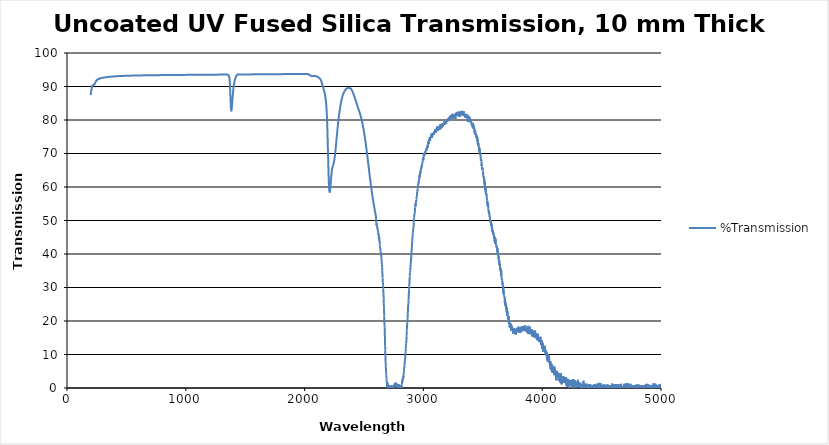
| Category | %Transmission |
|---|---|
| 200.0 | 87.428 |
| 201.0 | 87.778 |
| 202.0 | 88.083 |
| 203.0 | 88.344 |
| 204.0 | 88.635 |
| 205.0 | 88.902 |
| 206.0 | 89.097 |
| 207.0 | 89.337 |
| 208.0 | 89.529 |
| 209.0 | 89.623 |
| 210.0 | 89.787 |
| 211.0 | 89.901 |
| 212.0 | 90.016 |
| 213.0 | 90.113 |
| 214.0 | 90.202 |
| 215.0 | 90.23 |
| 216.0 | 90.302 |
| 217.0 | 90.351 |
| 218.0 | 90.356 |
| 219.0 | 90.401 |
| 220.0 | 90.414 |
| 221.0 | 90.381 |
| 222.0 | 90.471 |
| 223.0 | 90.485 |
| 224.0 | 90.482 |
| 225.0 | 90.541 |
| 226.0 | 90.559 |
| 227.0 | 90.525 |
| 228.0 | 90.577 |
| 229.0 | 90.617 |
| 230.0 | 90.607 |
| 231.0 | 90.71 |
| 232.0 | 90.729 |
| 233.0 | 90.756 |
| 234.0 | 90.831 |
| 235.0 | 90.918 |
| 236.0 | 90.964 |
| 237.0 | 91.063 |
| 238.0 | 91.155 |
| 239.0 | 91.175 |
| 240.0 | 91.287 |
| 241.0 | 91.365 |
| 242.0 | 91.411 |
| 243.0 | 91.494 |
| 244.0 | 91.572 |
| 245.0 | 91.59 |
| 246.0 | 91.684 |
| 247.0 | 91.779 |
| 248.0 | 91.776 |
| 249.0 | 91.831 |
| 250.0 | 91.902 |
| 251.0 | 91.879 |
| 252.0 | 91.984 |
| 253.0 | 91.984 |
| 254.0 | 91.994 |
| 255.0 | 92.016 |
| 256.0 | 92.077 |
| 257.0 | 92.055 |
| 258.0 | 92.086 |
| 259.0 | 92.129 |
| 260.0 | 92.091 |
| 261.0 | 92.158 |
| 262.0 | 92.177 |
| 263.0 | 92.16 |
| 264.0 | 92.205 |
| 265.0 | 92.22 |
| 266.0 | 92.2 |
| 267.0 | 92.258 |
| 268.0 | 92.284 |
| 269.0 | 92.251 |
| 270.0 | 92.319 |
| 271.0 | 92.323 |
| 272.0 | 92.293 |
| 273.0 | 92.358 |
| 274.0 | 92.373 |
| 275.0 | 92.328 |
| 276.0 | 92.392 |
| 277.0 | 92.422 |
| 278.0 | 92.397 |
| 279.0 | 92.448 |
| 280.0 | 92.456 |
| 281.0 | 92.465 |
| 282.0 | 92.473 |
| 283.0 | 92.481 |
| 284.0 | 92.489 |
| 285.0 | 92.497 |
| 286.0 | 92.505 |
| 287.0 | 92.513 |
| 288.0 | 92.521 |
| 289.0 | 92.528 |
| 290.0 | 92.536 |
| 291.0 | 92.543 |
| 292.0 | 92.55 |
| 293.0 | 92.558 |
| 294.0 | 92.565 |
| 295.0 | 92.572 |
| 296.0 | 92.579 |
| 297.0 | 92.586 |
| 298.0 | 92.593 |
| 299.0 | 92.599 |
| 300.0 | 92.606 |
| 301.0 | 92.612 |
| 302.0 | 92.619 |
| 303.0 | 92.625 |
| 304.0 | 92.632 |
| 305.0 | 92.638 |
| 306.0 | 92.644 |
| 307.0 | 92.65 |
| 308.0 | 92.656 |
| 309.0 | 92.662 |
| 310.0 | 92.668 |
| 311.0 | 92.674 |
| 312.0 | 92.68 |
| 313.0 | 92.686 |
| 314.0 | 92.691 |
| 315.0 | 92.697 |
| 316.0 | 92.702 |
| 317.0 | 92.708 |
| 318.0 | 92.713 |
| 319.0 | 92.719 |
| 320.0 | 92.724 |
| 321.0 | 92.729 |
| 322.0 | 92.735 |
| 323.0 | 92.74 |
| 324.0 | 92.745 |
| 325.0 | 92.75 |
| 326.0 | 92.755 |
| 327.0 | 92.76 |
| 328.0 | 92.765 |
| 329.0 | 92.769 |
| 330.0 | 92.774 |
| 331.0 | 92.779 |
| 332.0 | 92.784 |
| 333.0 | 92.788 |
| 334.0 | 92.793 |
| 335.0 | 92.797 |
| 336.0 | 92.802 |
| 337.0 | 92.806 |
| 338.0 | 92.811 |
| 339.0 | 92.815 |
| 340.0 | 92.819 |
| 341.0 | 92.824 |
| 342.0 | 92.828 |
| 343.0 | 92.832 |
| 344.0 | 92.836 |
| 345.0 | 92.84 |
| 346.0 | 92.844 |
| 347.0 | 92.849 |
| 348.0 | 92.853 |
| 349.0 | 92.856 |
| 350.0 | 92.86 |
| 351.0 | 92.864 |
| 352.0 | 92.868 |
| 353.0 | 92.872 |
| 354.0 | 92.876 |
| 355.0 | 92.879 |
| 356.0 | 92.883 |
| 357.0 | 92.887 |
| 358.0 | 92.89 |
| 359.0 | 92.894 |
| 360.0 | 92.898 |
| 361.0 | 92.901 |
| 362.0 | 92.905 |
| 363.0 | 92.908 |
| 364.0 | 92.912 |
| 365.0 | 92.915 |
| 366.0 | 92.918 |
| 367.0 | 92.922 |
| 368.0 | 92.925 |
| 369.0 | 92.928 |
| 370.0 | 92.932 |
| 371.0 | 92.935 |
| 372.0 | 92.938 |
| 373.0 | 92.941 |
| 374.0 | 92.944 |
| 375.0 | 92.948 |
| 376.0 | 92.951 |
| 377.0 | 92.954 |
| 378.0 | 92.957 |
| 379.0 | 92.96 |
| 380.0 | 92.963 |
| 381.0 | 92.966 |
| 382.0 | 92.969 |
| 383.0 | 92.972 |
| 384.0 | 92.975 |
| 385.0 | 92.977 |
| 386.0 | 92.98 |
| 387.0 | 92.983 |
| 388.0 | 92.986 |
| 389.0 | 92.989 |
| 390.0 | 92.991 |
| 391.0 | 92.994 |
| 392.0 | 92.997 |
| 393.0 | 93 |
| 394.0 | 93.002 |
| 395.0 | 93.005 |
| 396.0 | 93.007 |
| 397.0 | 93.01 |
| 398.0 | 93.013 |
| 399.0 | 93.015 |
| 400.0 | 93.018 |
| 401.0 | 93.02 |
| 402.0 | 93.023 |
| 403.0 | 93.025 |
| 404.0 | 93.028 |
| 405.0 | 93.03 |
| 406.0 | 93.033 |
| 407.0 | 93.035 |
| 408.0 | 93.037 |
| 409.0 | 93.04 |
| 410.0 | 93.042 |
| 411.0 | 93.044 |
| 412.0 | 93.047 |
| 413.0 | 93.049 |
| 414.0 | 93.051 |
| 415.0 | 93.053 |
| 416.0 | 93.056 |
| 417.0 | 93.058 |
| 418.0 | 93.06 |
| 419.0 | 93.062 |
| 420.0 | 93.065 |
| 421.0 | 93.067 |
| 422.0 | 93.069 |
| 423.0 | 93.071 |
| 424.0 | 93.073 |
| 425.0 | 93.075 |
| 426.0 | 93.077 |
| 427.0 | 93.079 |
| 428.0 | 93.081 |
| 429.0 | 93.083 |
| 430.0 | 93.085 |
| 431.0 | 93.087 |
| 432.0 | 93.089 |
| 433.0 | 93.091 |
| 434.0 | 93.093 |
| 435.0 | 93.095 |
| 436.0 | 93.097 |
| 437.0 | 93.099 |
| 438.0 | 93.101 |
| 439.0 | 93.103 |
| 440.0 | 93.105 |
| 441.0 | 93.107 |
| 442.0 | 93.109 |
| 443.0 | 93.11 |
| 444.0 | 93.112 |
| 445.0 | 93.114 |
| 446.0 | 93.116 |
| 447.0 | 93.118 |
| 448.0 | 93.119 |
| 449.0 | 93.121 |
| 450.0 | 93.123 |
| 451.0 | 93.125 |
| 452.0 | 93.126 |
| 453.0 | 93.128 |
| 454.0 | 93.13 |
| 455.0 | 93.132 |
| 456.0 | 93.133 |
| 457.0 | 93.135 |
| 458.0 | 93.137 |
| 459.0 | 93.138 |
| 460.0 | 93.14 |
| 461.0 | 93.142 |
| 462.0 | 93.143 |
| 463.0 | 93.145 |
| 464.0 | 93.146 |
| 465.0 | 93.148 |
| 466.0 | 93.15 |
| 467.0 | 93.151 |
| 468.0 | 93.153 |
| 469.0 | 93.154 |
| 470.0 | 93.156 |
| 471.0 | 93.157 |
| 472.0 | 93.159 |
| 473.0 | 93.16 |
| 474.0 | 93.162 |
| 475.0 | 93.163 |
| 476.0 | 93.165 |
| 477.0 | 93.166 |
| 478.0 | 93.168 |
| 479.0 | 93.169 |
| 480.0 | 93.171 |
| 481.0 | 93.172 |
| 482.0 | 93.173 |
| 483.0 | 93.175 |
| 484.0 | 93.176 |
| 485.0 | 93.178 |
| 486.0 | 93.179 |
| 487.0 | 93.18 |
| 488.0 | 93.182 |
| 489.0 | 93.183 |
| 490.0 | 93.185 |
| 491.0 | 93.186 |
| 492.0 | 93.187 |
| 493.0 | 93.189 |
| 494.0 | 93.19 |
| 495.0 | 93.191 |
| 496.0 | 93.193 |
| 497.0 | 93.194 |
| 498.0 | 93.195 |
| 499.0 | 93.196 |
| 500.0 | 93.198 |
| 501.0 | 93.199 |
| 502.0 | 93.2 |
| 503.0 | 93.201 |
| 504.0 | 93.203 |
| 505.0 | 93.204 |
| 506.0 | 93.205 |
| 507.0 | 93.206 |
| 508.0 | 93.208 |
| 509.0 | 93.209 |
| 510.0 | 93.21 |
| 511.0 | 93.211 |
| 512.0 | 93.212 |
| 513.0 | 93.214 |
| 514.0 | 93.215 |
| 515.0 | 93.216 |
| 516.0 | 93.217 |
| 517.0 | 93.218 |
| 518.0 | 93.219 |
| 519.0 | 93.221 |
| 520.0 | 93.222 |
| 521.0 | 93.223 |
| 522.0 | 93.224 |
| 523.0 | 93.225 |
| 524.0 | 93.226 |
| 525.0 | 93.227 |
| 526.0 | 93.228 |
| 527.0 | 93.23 |
| 528.0 | 93.231 |
| 529.0 | 93.232 |
| 530.0 | 93.233 |
| 531.0 | 93.234 |
| 532.0 | 93.235 |
| 533.0 | 93.236 |
| 534.0 | 93.237 |
| 535.0 | 93.238 |
| 536.0 | 93.239 |
| 537.0 | 93.24 |
| 538.0 | 93.241 |
| 539.0 | 93.242 |
| 540.0 | 93.243 |
| 541.0 | 93.244 |
| 542.0 | 93.245 |
| 543.0 | 93.246 |
| 544.0 | 93.247 |
| 545.0 | 93.248 |
| 546.0 | 93.249 |
| 547.0 | 93.25 |
| 548.0 | 93.251 |
| 549.0 | 93.252 |
| 550.0 | 93.253 |
| 551.0 | 93.254 |
| 552.0 | 93.255 |
| 553.0 | 93.256 |
| 554.0 | 93.257 |
| 555.0 | 93.258 |
| 556.0 | 93.259 |
| 557.0 | 93.26 |
| 558.0 | 93.261 |
| 559.0 | 93.262 |
| 560.0 | 93.263 |
| 561.0 | 93.264 |
| 562.0 | 93.265 |
| 563.0 | 93.265 |
| 564.0 | 93.266 |
| 565.0 | 93.267 |
| 566.0 | 93.268 |
| 567.0 | 93.269 |
| 568.0 | 93.27 |
| 569.0 | 93.271 |
| 570.0 | 93.272 |
| 571.0 | 93.273 |
| 572.0 | 93.273 |
| 573.0 | 93.274 |
| 574.0 | 93.275 |
| 575.0 | 93.276 |
| 576.0 | 93.277 |
| 577.0 | 93.278 |
| 578.0 | 93.279 |
| 579.0 | 93.279 |
| 580.0 | 93.28 |
| 581.0 | 93.281 |
| 582.0 | 93.282 |
| 583.0 | 93.283 |
| 584.0 | 93.284 |
| 585.0 | 93.284 |
| 586.0 | 93.285 |
| 587.0 | 93.286 |
| 588.0 | 93.287 |
| 589.0 | 93.288 |
| 590.0 | 93.289 |
| 591.0 | 93.289 |
| 592.0 | 93.29 |
| 593.0 | 93.291 |
| 594.0 | 93.292 |
| 595.0 | 93.292 |
| 596.0 | 93.293 |
| 597.0 | 93.294 |
| 598.0 | 93.295 |
| 599.0 | 93.296 |
| 600.0 | 93.296 |
| 601.0 | 93.297 |
| 602.0 | 93.298 |
| 603.0 | 93.299 |
| 604.0 | 93.299 |
| 605.0 | 93.3 |
| 606.0 | 93.301 |
| 607.0 | 93.302 |
| 608.0 | 93.302 |
| 609.0 | 93.303 |
| 610.0 | 93.304 |
| 611.0 | 93.305 |
| 612.0 | 93.305 |
| 613.0 | 93.306 |
| 614.0 | 93.307 |
| 615.0 | 93.307 |
| 616.0 | 93.308 |
| 617.0 | 93.309 |
| 618.0 | 93.31 |
| 619.0 | 93.31 |
| 620.0 | 93.311 |
| 621.0 | 93.312 |
| 622.0 | 93.312 |
| 623.0 | 93.313 |
| 624.0 | 93.314 |
| 625.0 | 93.314 |
| 626.0 | 93.315 |
| 627.0 | 93.316 |
| 628.0 | 93.317 |
| 629.0 | 93.317 |
| 630.0 | 93.318 |
| 631.0 | 93.319 |
| 632.0 | 93.319 |
| 633.0 | 93.32 |
| 634.0 | 93.321 |
| 635.0 | 93.321 |
| 636.0 | 93.322 |
| 637.0 | 93.323 |
| 638.0 | 93.323 |
| 639.0 | 93.324 |
| 640.0 | 93.324 |
| 641.0 | 93.325 |
| 642.0 | 93.326 |
| 643.0 | 93.326 |
| 644.0 | 93.327 |
| 645.0 | 93.328 |
| 646.0 | 93.328 |
| 647.0 | 93.329 |
| 648.0 | 93.33 |
| 649.0 | 93.33 |
| 650.0 | 93.331 |
| 651.0 | 93.331 |
| 652.0 | 93.332 |
| 653.0 | 93.333 |
| 654.0 | 93.333 |
| 655.0 | 93.334 |
| 656.0 | 93.335 |
| 657.0 | 93.335 |
| 658.0 | 93.336 |
| 659.0 | 93.336 |
| 660.0 | 93.337 |
| 661.0 | 93.338 |
| 662.0 | 93.338 |
| 663.0 | 93.339 |
| 664.0 | 93.339 |
| 665.0 | 93.34 |
| 666.0 | 93.34 |
| 667.0 | 93.341 |
| 668.0 | 93.342 |
| 669.0 | 93.342 |
| 670.0 | 93.343 |
| 671.0 | 93.343 |
| 672.0 | 93.344 |
| 673.0 | 93.345 |
| 674.0 | 93.345 |
| 675.0 | 93.346 |
| 676.0 | 93.346 |
| 677.0 | 93.347 |
| 678.0 | 93.347 |
| 679.0 | 93.348 |
| 680.0 | 93.349 |
| 681.0 | 93.349 |
| 682.0 | 93.35 |
| 683.0 | 93.35 |
| 684.0 | 93.351 |
| 685.0 | 93.351 |
| 686.0 | 93.352 |
| 687.0 | 93.352 |
| 688.0 | 93.353 |
| 689.0 | 93.353 |
| 690.0 | 93.354 |
| 691.0 | 93.355 |
| 692.0 | 93.355 |
| 693.0 | 93.356 |
| 694.0 | 93.356 |
| 695.0 | 93.357 |
| 696.0 | 93.357 |
| 697.0 | 93.358 |
| 698.0 | 93.358 |
| 699.0 | 93.359 |
| 700.0 | 93.359 |
| 701.0 | 93.36 |
| 702.0 | 93.36 |
| 703.0 | 93.361 |
| 704.0 | 93.361 |
| 705.0 | 93.362 |
| 706.0 | 93.362 |
| 707.0 | 93.363 |
| 708.0 | 93.363 |
| 709.0 | 93.364 |
| 710.0 | 93.364 |
| 711.0 | 93.365 |
| 712.0 | 93.365 |
| 713.0 | 93.366 |
| 714.0 | 93.366 |
| 715.0 | 93.367 |
| 716.0 | 93.367 |
| 717.0 | 93.368 |
| 718.0 | 93.368 |
| 719.0 | 93.369 |
| 720.0 | 93.369 |
| 721.0 | 93.37 |
| 722.0 | 93.37 |
| 723.0 | 93.371 |
| 724.0 | 93.371 |
| 725.0 | 93.372 |
| 726.0 | 93.372 |
| 727.0 | 93.373 |
| 728.0 | 93.373 |
| 729.0 | 93.374 |
| 730.0 | 93.374 |
| 731.0 | 93.375 |
| 732.0 | 93.375 |
| 733.0 | 93.376 |
| 734.0 | 93.376 |
| 735.0 | 93.377 |
| 736.0 | 93.377 |
| 737.0 | 93.378 |
| 738.0 | 93.378 |
| 739.0 | 93.378 |
| 740.0 | 93.379 |
| 741.0 | 93.379 |
| 742.0 | 93.38 |
| 743.0 | 93.38 |
| 744.0 | 93.381 |
| 745.0 | 93.381 |
| 746.0 | 93.382 |
| 747.0 | 93.382 |
| 748.0 | 93.383 |
| 749.0 | 93.383 |
| 750.0 | 93.384 |
| 751.0 | 93.384 |
| 752.0 | 93.384 |
| 753.0 | 93.385 |
| 754.0 | 93.385 |
| 755.0 | 93.386 |
| 756.0 | 93.386 |
| 757.0 | 93.387 |
| 758.0 | 93.387 |
| 759.0 | 93.388 |
| 760.0 | 93.388 |
| 761.0 | 93.388 |
| 762.0 | 93.389 |
| 763.0 | 93.389 |
| 764.0 | 93.39 |
| 765.0 | 93.39 |
| 766.0 | 93.391 |
| 767.0 | 93.391 |
| 768.0 | 93.391 |
| 769.0 | 93.392 |
| 770.0 | 93.392 |
| 771.0 | 93.393 |
| 772.0 | 93.393 |
| 773.0 | 93.394 |
| 774.0 | 93.394 |
| 775.0 | 93.394 |
| 776.0 | 93.395 |
| 777.0 | 93.395 |
| 778.0 | 93.396 |
| 779.0 | 93.396 |
| 780.0 | 93.396 |
| 781.0 | 93.397 |
| 782.0 | 93.397 |
| 783.0 | 93.398 |
| 784.0 | 93.398 |
| 785.0 | 93.399 |
| 786.0 | 93.399 |
| 787.0 | 93.399 |
| 788.0 | 93.4 |
| 789.0 | 93.4 |
| 790.0 | 93.401 |
| 791.0 | 93.401 |
| 792.0 | 93.401 |
| 793.0 | 93.402 |
| 794.0 | 93.402 |
| 795.0 | 93.403 |
| 796.0 | 93.403 |
| 797.0 | 93.403 |
| 798.0 | 93.404 |
| 799.0 | 93.404 |
| 800.0 | 93.405 |
| 801.0 | 93.405 |
| 802.0 | 93.405 |
| 803.0 | 93.406 |
| 804.0 | 93.406 |
| 805.0 | 93.407 |
| 806.0 | 93.407 |
| 807.0 | 93.407 |
| 808.0 | 93.408 |
| 809.0 | 93.408 |
| 810.0 | 93.408 |
| 811.0 | 93.409 |
| 812.0 | 93.409 |
| 813.0 | 93.41 |
| 814.0 | 93.41 |
| 815.0 | 93.41 |
| 816.0 | 93.411 |
| 817.0 | 93.411 |
| 818.0 | 93.412 |
| 819.0 | 93.412 |
| 820.0 | 93.412 |
| 821.0 | 93.413 |
| 822.0 | 93.413 |
| 823.0 | 93.413 |
| 824.0 | 93.414 |
| 825.0 | 93.414 |
| 826.0 | 93.415 |
| 827.0 | 93.415 |
| 828.0 | 93.415 |
| 829.0 | 93.416 |
| 830.0 | 93.416 |
| 831.0 | 93.416 |
| 832.0 | 93.417 |
| 833.0 | 93.417 |
| 834.0 | 93.418 |
| 835.0 | 93.418 |
| 836.0 | 93.418 |
| 837.0 | 93.419 |
| 838.0 | 93.419 |
| 839.0 | 93.419 |
| 840.0 | 93.42 |
| 841.0 | 93.42 |
| 842.0 | 93.42 |
| 843.0 | 93.421 |
| 844.0 | 93.421 |
| 845.0 | 93.422 |
| 846.0 | 93.422 |
| 847.0 | 93.422 |
| 848.0 | 93.423 |
| 849.0 | 93.423 |
| 850.0 | 93.423 |
| 851.0 | 93.424 |
| 852.0 | 93.424 |
| 853.0 | 93.424 |
| 854.0 | 93.425 |
| 855.0 | 93.425 |
| 856.0 | 93.425 |
| 857.0 | 93.426 |
| 858.0 | 93.426 |
| 859.0 | 93.426 |
| 860.0 | 93.427 |
| 861.0 | 93.427 |
| 862.0 | 93.428 |
| 863.0 | 93.428 |
| 864.0 | 93.428 |
| 865.0 | 93.429 |
| 866.0 | 93.429 |
| 867.0 | 93.429 |
| 868.0 | 93.43 |
| 869.0 | 93.43 |
| 870.0 | 93.43 |
| 871.0 | 93.431 |
| 872.0 | 93.431 |
| 873.0 | 93.431 |
| 874.0 | 93.432 |
| 875.0 | 93.432 |
| 876.0 | 93.432 |
| 877.0 | 93.433 |
| 878.0 | 93.433 |
| 879.0 | 93.433 |
| 880.0 | 93.434 |
| 881.0 | 93.434 |
| 882.0 | 93.434 |
| 883.0 | 93.435 |
| 884.0 | 93.435 |
| 885.0 | 93.435 |
| 886.0 | 93.436 |
| 887.0 | 93.436 |
| 888.0 | 93.436 |
| 889.0 | 93.437 |
| 890.0 | 93.437 |
| 891.0 | 93.437 |
| 892.0 | 93.438 |
| 893.0 | 93.438 |
| 894.0 | 93.438 |
| 895.0 | 93.439 |
| 896.0 | 93.439 |
| 897.0 | 93.439 |
| 898.0 | 93.44 |
| 899.0 | 93.44 |
| 900.0 | 93.44 |
| 901.0 | 93.441 |
| 902.0 | 93.441 |
| 903.0 | 93.441 |
| 904.0 | 93.442 |
| 905.0 | 93.442 |
| 906.0 | 93.442 |
| 907.0 | 93.443 |
| 908.0 | 93.443 |
| 909.0 | 93.443 |
| 910.0 | 93.444 |
| 911.0 | 93.444 |
| 912.0 | 93.444 |
| 913.0 | 93.444 |
| 914.0 | 93.445 |
| 915.0 | 93.445 |
| 916.0 | 93.445 |
| 917.0 | 93.446 |
| 918.0 | 93.446 |
| 919.0 | 93.446 |
| 920.0 | 93.447 |
| 921.0 | 93.447 |
| 922.0 | 93.447 |
| 923.0 | 93.448 |
| 924.0 | 93.448 |
| 925.0 | 93.448 |
| 926.0 | 93.449 |
| 927.0 | 93.449 |
| 928.0 | 93.449 |
| 929.0 | 93.45 |
| 930.0 | 93.45 |
| 931.0 | 93.45 |
| 932.0 | 93.45 |
| 933.0 | 93.451 |
| 934.0 | 93.451 |
| 935.0 | 93.451 |
| 936.0 | 93.452 |
| 937.0 | 93.452 |
| 938.0 | 93.452 |
| 939.0 | 93.453 |
| 940.0 | 93.453 |
| 941.0 | 93.453 |
| 942.0 | 93.454 |
| 943.0 | 93.454 |
| 944.0 | 93.454 |
| 945.0 | 93.455 |
| 946.0 | 93.455 |
| 947.0 | 93.455 |
| 948.0 | 93.455 |
| 949.0 | 93.456 |
| 950.0 | 93.456 |
| 951.0 | 93.456 |
| 952.0 | 93.457 |
| 953.0 | 93.457 |
| 954.0 | 93.457 |
| 955.0 | 93.458 |
| 956.0 | 93.458 |
| 957.0 | 93.458 |
| 958.0 | 93.458 |
| 959.0 | 93.459 |
| 960.0 | 93.459 |
| 961.0 | 93.459 |
| 962.0 | 93.46 |
| 963.0 | 93.46 |
| 964.0 | 93.46 |
| 965.0 | 93.461 |
| 966.0 | 93.461 |
| 967.0 | 93.461 |
| 968.0 | 93.461 |
| 969.0 | 93.462 |
| 970.0 | 93.462 |
| 971.0 | 93.462 |
| 972.0 | 93.463 |
| 973.0 | 93.463 |
| 974.0 | 93.463 |
| 975.0 | 93.464 |
| 976.0 | 93.464 |
| 977.0 | 93.464 |
| 978.0 | 93.464 |
| 979.0 | 93.465 |
| 980.0 | 93.465 |
| 981.0 | 93.465 |
| 982.0 | 93.466 |
| 983.0 | 93.466 |
| 984.0 | 93.466 |
| 985.0 | 93.466 |
| 986.0 | 93.467 |
| 987.0 | 93.467 |
| 988.0 | 93.467 |
| 989.0 | 93.468 |
| 990.0 | 93.468 |
| 991.0 | 93.468 |
| 992.0 | 93.469 |
| 993.0 | 93.469 |
| 994.0 | 93.469 |
| 995.0 | 93.469 |
| 996.0 | 93.47 |
| 997.0 | 93.47 |
| 998.0 | 93.47 |
| 999.0 | 93.471 |
| 1000.0 | 93.471 |
| 1001.0 | 93.471 |
| 1002.0 | 93.471 |
| 1003.0 | 93.472 |
| 1004.0 | 93.472 |
| 1005.0 | 93.472 |
| 1006.0 | 93.473 |
| 1007.0 | 93.473 |
| 1008.0 | 93.473 |
| 1009.0 | 93.473 |
| 1010.0 | 93.474 |
| 1011.0 | 93.474 |
| 1012.0 | 93.474 |
| 1013.0 | 93.475 |
| 1014.0 | 93.475 |
| 1015.0 | 93.475 |
| 1016.0 | 93.475 |
| 1017.0 | 93.476 |
| 1018.0 | 93.476 |
| 1019.0 | 93.476 |
| 1020.0 | 93.477 |
| 1021.0 | 93.477 |
| 1022.0 | 93.477 |
| 1023.0 | 93.477 |
| 1024.0 | 93.478 |
| 1025.0 | 93.478 |
| 1026.0 | 93.478 |
| 1027.0 | 93.479 |
| 1028.0 | 93.479 |
| 1029.0 | 93.479 |
| 1030.0 | 93.479 |
| 1031.0 | 93.48 |
| 1032.0 | 93.48 |
| 1033.0 | 93.48 |
| 1034.0 | 93.48 |
| 1035.0 | 93.481 |
| 1036.0 | 93.481 |
| 1037.0 | 93.481 |
| 1038.0 | 93.482 |
| 1039.0 | 93.482 |
| 1040.0 | 93.482 |
| 1041.0 | 93.482 |
| 1042.0 | 93.483 |
| 1043.0 | 93.483 |
| 1044.0 | 93.483 |
| 1045.0 | 93.484 |
| 1046.0 | 93.484 |
| 1047.0 | 93.484 |
| 1048.0 | 93.484 |
| 1049.0 | 93.485 |
| 1050.0 | 93.485 |
| 1051.0 | 93.485 |
| 1052.0 | 93.486 |
| 1053.0 | 93.486 |
| 1054.0 | 93.486 |
| 1055.0 | 93.486 |
| 1056.0 | 93.487 |
| 1057.0 | 93.487 |
| 1058.0 | 93.487 |
| 1059.0 | 93.487 |
| 1060.0 | 93.488 |
| 1061.0 | 93.488 |
| 1062.0 | 93.488 |
| 1063.0 | 93.489 |
| 1064.0 | 93.489 |
| 1065.0 | 93.489 |
| 1066.0 | 93.489 |
| 1067.0 | 93.49 |
| 1068.0 | 93.49 |
| 1069.0 | 93.49 |
| 1070.0 | 93.49 |
| 1071.0 | 93.491 |
| 1072.0 | 93.491 |
| 1073.0 | 93.491 |
| 1074.0 | 93.492 |
| 1075.0 | 93.492 |
| 1076.0 | 93.492 |
| 1077.0 | 93.492 |
| 1078.0 | 93.493 |
| 1079.0 | 93.493 |
| 1080.0 | 93.493 |
| 1081.0 | 93.493 |
| 1082.0 | 93.494 |
| 1083.0 | 93.494 |
| 1084.0 | 93.494 |
| 1085.0 | 93.495 |
| 1086.0 | 93.495 |
| 1087.0 | 93.495 |
| 1088.0 | 93.495 |
| 1089.0 | 93.496 |
| 1090.0 | 93.496 |
| 1091.0 | 93.496 |
| 1092.0 | 93.496 |
| 1093.0 | 93.497 |
| 1094.0 | 93.497 |
| 1095.0 | 93.497 |
| 1096.0 | 93.498 |
| 1097.0 | 93.498 |
| 1098.0 | 93.498 |
| 1099.0 | 93.498 |
| 1100.0 | 93.499 |
| 1101.0 | 93.499 |
| 1102.0 | 93.499 |
| 1103.0 | 93.499 |
| 1104.0 | 93.5 |
| 1105.0 | 93.5 |
| 1106.0 | 93.5 |
| 1107.0 | 93.5 |
| 1108.0 | 93.501 |
| 1109.0 | 93.501 |
| 1110.0 | 93.501 |
| 1111.0 | 93.502 |
| 1112.0 | 93.502 |
| 1113.0 | 93.502 |
| 1114.0 | 93.502 |
| 1115.0 | 93.503 |
| 1116.0 | 93.503 |
| 1117.0 | 93.503 |
| 1118.0 | 93.503 |
| 1119.0 | 93.504 |
| 1120.0 | 93.504 |
| 1121.0 | 93.504 |
| 1122.0 | 93.504 |
| 1123.0 | 93.505 |
| 1124.0 | 93.505 |
| 1125.0 | 93.505 |
| 1126.0 | 93.506 |
| 1127.0 | 93.506 |
| 1128.0 | 93.506 |
| 1129.0 | 93.506 |
| 1130.0 | 93.507 |
| 1131.0 | 93.507 |
| 1132.0 | 93.508 |
| 1133.0 | 93.508 |
| 1134.0 | 93.508 |
| 1135.0 | 93.509 |
| 1136.0 | 93.509 |
| 1137.0 | 93.509 |
| 1138.0 | 93.509 |
| 1139.0 | 93.51 |
| 1140.0 | 93.51 |
| 1141.0 | 93.51 |
| 1142.0 | 93.51 |
| 1143.0 | 93.511 |
| 1144.0 | 93.511 |
| 1145.0 | 93.511 |
| 1146.0 | 93.511 |
| 1147.0 | 93.512 |
| 1148.0 | 93.512 |
| 1149.0 | 93.512 |
| 1150.0 | 93.512 |
| 1151.0 | 93.513 |
| 1152.0 | 93.513 |
| 1153.0 | 93.513 |
| 1154.0 | 93.514 |
| 1155.0 | 93.514 |
| 1156.0 | 93.514 |
| 1157.0 | 93.514 |
| 1158.0 | 93.515 |
| 1159.0 | 93.515 |
| 1160.0 | 93.515 |
| 1161.0 | 93.515 |
| 1162.0 | 93.516 |
| 1163.0 | 93.516 |
| 1164.0 | 93.516 |
| 1165.0 | 93.516 |
| 1166.0 | 93.517 |
| 1167.0 | 93.517 |
| 1168.0 | 93.517 |
| 1169.0 | 93.517 |
| 1170.0 | 93.518 |
| 1171.0 | 93.518 |
| 1172.0 | 93.518 |
| 1173.0 | 93.518 |
| 1174.0 | 93.519 |
| 1175.0 | 93.519 |
| 1176.0 | 93.519 |
| 1177.0 | 93.52 |
| 1178.0 | 93.52 |
| 1179.0 | 93.52 |
| 1180.0 | 93.52 |
| 1181.0 | 93.521 |
| 1182.0 | 93.521 |
| 1183.0 | 93.521 |
| 1184.0 | 93.521 |
| 1185.0 | 93.522 |
| 1186.0 | 93.522 |
| 1187.0 | 93.522 |
| 1188.0 | 93.522 |
| 1189.0 | 93.523 |
| 1190.0 | 93.523 |
| 1191.0 | 93.523 |
| 1192.0 | 93.523 |
| 1193.0 | 93.524 |
| 1194.0 | 93.524 |
| 1195.0 | 93.524 |
| 1196.0 | 93.524 |
| 1197.0 | 93.525 |
| 1198.0 | 93.525 |
| 1199.0 | 93.525 |
| 1200.0 | 93.526 |
| 1201.0 | 93.526 |
| 1202.0 | 93.526 |
| 1203.0 | 93.526 |
| 1204.0 | 93.527 |
| 1205.0 | 93.527 |
| 1206.0 | 93.527 |
| 1207.0 | 93.527 |
| 1208.0 | 93.528 |
| 1209.0 | 93.528 |
| 1210.0 | 93.528 |
| 1211.0 | 93.528 |
| 1212.0 | 93.529 |
| 1213.0 | 93.529 |
| 1214.0 | 93.529 |
| 1215.0 | 93.529 |
| 1216.0 | 93.53 |
| 1217.0 | 93.53 |
| 1218.0 | 93.53 |
| 1219.0 | 93.53 |
| 1220.0 | 93.531 |
| 1221.0 | 93.531 |
| 1222.0 | 93.531 |
| 1223.0 | 93.531 |
| 1224.0 | 93.532 |
| 1225.0 | 93.532 |
| 1226.0 | 93.532 |
| 1227.0 | 93.532 |
| 1228.0 | 93.533 |
| 1229.0 | 93.533 |
| 1230.0 | 93.533 |
| 1231.0 | 93.534 |
| 1232.0 | 93.534 |
| 1233.0 | 93.534 |
| 1234.0 | 93.534 |
| 1235.0 | 93.535 |
| 1236.0 | 93.535 |
| 1237.0 | 93.535 |
| 1238.0 | 93.535 |
| 1239.0 | 93.536 |
| 1240.0 | 93.536 |
| 1241.0 | 93.536 |
| 1242.0 | 93.536 |
| 1243.0 | 93.537 |
| 1244.0 | 93.537 |
| 1245.0 | 93.537 |
| 1246.0 | 93.537 |
| 1247.0 | 93.538 |
| 1248.0 | 93.538 |
| 1249.0 | 93.538 |
| 1250.0 | 93.538 |
| 1251.0 | 93.539 |
| 1252.0 | 93.539 |
| 1253.0 | 93.539 |
| 1254.0 | 93.539 |
| 1255.0 | 93.54 |
| 1256.0 | 93.54 |
| 1257.0 | 93.54 |
| 1258.0 | 93.54 |
| 1259.0 | 93.541 |
| 1260.0 | 93.541 |
| 1261.0 | 93.541 |
| 1262.0 | 93.542 |
| 1263.0 | 93.542 |
| 1264.0 | 93.542 |
| 1265.0 | 93.542 |
| 1266.0 | 93.543 |
| 1267.0 | 93.543 |
| 1268.0 | 93.543 |
| 1269.0 | 93.543 |
| 1270.0 | 93.544 |
| 1271.0 | 93.544 |
| 1272.0 | 93.544 |
| 1273.0 | 93.544 |
| 1274.0 | 93.545 |
| 1275.0 | 93.545 |
| 1276.0 | 93.545 |
| 1277.0 | 93.545 |
| 1278.0 | 93.546 |
| 1279.0 | 93.546 |
| 1280.0 | 93.546 |
| 1281.0 | 93.546 |
| 1282.0 | 93.547 |
| 1283.0 | 93.547 |
| 1284.0 | 93.547 |
| 1285.0 | 93.547 |
| 1286.0 | 93.548 |
| 1287.0 | 93.548 |
| 1288.0 | 93.548 |
| 1289.0 | 93.548 |
| 1290.0 | 93.549 |
| 1291.0 | 93.549 |
| 1292.0 | 93.549 |
| 1293.0 | 93.549 |
| 1294.0 | 93.55 |
| 1295.0 | 93.55 |
| 1296.0 | 93.55 |
| 1297.0 | 93.551 |
| 1298.0 | 93.551 |
| 1299.0 | 93.551 |
| 1300.0 | 93.551 |
| 1301.0 | 93.552 |
| 1302.0 | 93.552 |
| 1303.0 | 93.552 |
| 1304.0 | 93.552 |
| 1305.0 | 93.553 |
| 1306.0 | 93.553 |
| 1307.0 | 93.553 |
| 1308.0 | 93.553 |
| 1309.0 | 93.554 |
| 1310.0 | 93.554 |
| 1311.0 | 93.554 |
| 1312.0 | 93.554 |
| 1313.0 | 93.555 |
| 1314.0 | 93.555 |
| 1315.0 | 93.555 |
| 1316.0 | 93.555 |
| 1317.0 | 93.556 |
| 1318.0 | 93.556 |
| 1319.0 | 93.556 |
| 1320.0 | 93.556 |
| 1321.0 | 93.557 |
| 1322.0 | 93.557 |
| 1323.0 | 93.557 |
| 1324.0 | 93.557 |
| 1325.0 | 93.558 |
| 1326.0 | 93.558 |
| 1327.0 | 93.558 |
| 1328.0 | 93.558 |
| 1329.0 | 93.559 |
| 1330.0 | 93.559 |
| 1331.0 | 93.559 |
| 1332.0 | 93.56 |
| 1333.0 | 93.56 |
| 1334.0 | 93.56 |
| 1335.0 | 93.56 |
| 1336.0 | 93.561 |
| 1337.0 | 93.561 |
| 1338.0 | 93.561 |
| 1339.0 | 93.561 |
| 1340.0 | 93.562 |
| 1341.0 | 93.562 |
| 1342.0 | 93.562 |
| 1343.0 | 93.562 |
| 1344.0 | 93.563 |
| 1345.0 | 93.563 |
| 1346.0 | 93.563 |
| 1347.0 | 93.563 |
| 1348.0 | 93.564 |
| 1349.0 | 93.564 |
| 1350.0 | 93.538 |
| 1351.0 | 93.538 |
| 1352.0 | 93.533 |
| 1353.0 | 93.538 |
| 1354.0 | 93.496 |
| 1355.0 | 93.496 |
| 1356.0 | 93.456 |
| 1357.0 | 93.387 |
| 1358.0 | 93.345 |
| 1359.0 | 93.295 |
| 1360.0 | 93.327 |
| 1361.0 | 93.243 |
| 1362.0 | 93.158 |
| 1363.0 | 93.091 |
| 1364.0 | 92.994 |
| 1365.0 | 92.857 |
| 1366.0 | 92.726 |
| 1367.0 | 92.536 |
| 1368.0 | 92.306 |
| 1369.0 | 91.938 |
| 1370.0 | 91.523 |
| 1371.0 | 90.956 |
| 1372.0 | 90.243 |
| 1373.0 | 89.414 |
| 1374.0 | 88.463 |
| 1375.0 | 87.535 |
| 1376.0 | 86.49 |
| 1377.0 | 85.552 |
| 1378.0 | 84.692 |
| 1379.0 | 83.898 |
| 1380.0 | 83.403 |
| 1381.0 | 83.164 |
| 1382.0 | 82.88 |
| 1383.0 | 82.763 |
| 1384.0 | 82.794 |
| 1385.0 | 82.954 |
| 1386.0 | 83.239 |
| 1387.0 | 83.618 |
| 1388.0 | 84.007 |
| 1389.0 | 84.39 |
| 1390.0 | 84.819 |
| 1391.0 | 85.261 |
| 1392.0 | 85.781 |
| 1393.0 | 86.224 |
| 1394.0 | 86.712 |
| 1395.0 | 87.256 |
| 1396.0 | 87.538 |
| 1397.0 | 87.996 |
| 1398.0 | 88.336 |
| 1399.0 | 88.724 |
| 1400.0 | 89.217 |
| 1401.0 | 89.4 |
| 1402.0 | 89.736 |
| 1403.0 | 89.968 |
| 1404.0 | 90.283 |
| 1405.0 | 90.549 |
| 1406.0 | 90.753 |
| 1407.0 | 90.961 |
| 1408.0 | 91.181 |
| 1409.0 | 91.364 |
| 1410.0 | 91.512 |
| 1411.0 | 91.693 |
| 1412.0 | 91.843 |
| 1413.0 | 91.989 |
| 1414.0 | 92.129 |
| 1415.0 | 92.241 |
| 1416.0 | 92.328 |
| 1417.0 | 92.442 |
| 1418.0 | 92.562 |
| 1419.0 | 92.638 |
| 1420.0 | 92.705 |
| 1421.0 | 92.808 |
| 1422.0 | 92.893 |
| 1423.0 | 92.977 |
| 1424.0 | 93.052 |
| 1425.0 | 93.111 |
| 1426.0 | 93.19 |
| 1427.0 | 93.235 |
| 1428.0 | 93.288 |
| 1429.0 | 93.341 |
| 1430.0 | 93.386 |
| 1431.0 | 93.451 |
| 1432.0 | 93.516 |
| 1433.0 | 93.569 |
| 1434.0 | 93.586 |
| 1435.0 | 93.586 |
| 1436.0 | 93.587 |
| 1437.0 | 93.587 |
| 1438.0 | 93.587 |
| 1439.0 | 93.587 |
| 1440.0 | 93.588 |
| 1441.0 | 93.588 |
| 1442.0 | 93.588 |
| 1443.0 | 93.588 |
| 1444.0 | 93.589 |
| 1445.0 | 93.589 |
| 1446.0 | 93.589 |
| 1447.0 | 93.589 |
| 1448.0 | 93.59 |
| 1449.0 | 93.59 |
| 1450.0 | 93.59 |
| 1451.0 | 93.591 |
| 1452.0 | 93.591 |
| 1453.0 | 93.591 |
| 1454.0 | 93.591 |
| 1455.0 | 93.592 |
| 1456.0 | 93.592 |
| 1457.0 | 93.592 |
| 1458.0 | 93.592 |
| 1459.0 | 93.593 |
| 1460.0 | 93.593 |
| 1461.0 | 93.593 |
| 1462.0 | 93.593 |
| 1463.0 | 93.594 |
| 1464.0 | 93.594 |
| 1465.0 | 93.594 |
| 1466.0 | 93.595 |
| 1467.0 | 93.595 |
| 1468.0 | 93.595 |
| 1469.0 | 93.595 |
| 1470.0 | 93.596 |
| 1471.0 | 93.596 |
| 1472.0 | 93.596 |
| 1473.0 | 93.596 |
| 1474.0 | 93.597 |
| 1475.0 | 93.597 |
| 1476.0 | 93.597 |
| 1477.0 | 93.597 |
| 1478.0 | 93.598 |
| 1479.0 | 93.598 |
| 1480.0 | 93.598 |
| 1481.0 | 93.598 |
| 1482.0 | 93.599 |
| 1483.0 | 93.599 |
| 1484.0 | 93.599 |
| 1485.0 | 93.6 |
| 1486.0 | 93.6 |
| 1487.0 | 93.6 |
| 1488.0 | 93.6 |
| 1489.0 | 93.601 |
| 1490.0 | 93.601 |
| 1491.0 | 93.601 |
| 1492.0 | 93.601 |
| 1493.0 | 93.602 |
| 1494.0 | 93.602 |
| 1495.0 | 93.602 |
| 1496.0 | 93.602 |
| 1497.0 | 93.603 |
| 1498.0 | 93.603 |
| 1499.0 | 93.603 |
| 1500.0 | 93.604 |
| 1501.0 | 93.604 |
| 1502.0 | 93.604 |
| 1503.0 | 93.604 |
| 1504.0 | 93.605 |
| 1505.0 | 93.605 |
| 1506.0 | 93.605 |
| 1507.0 | 93.605 |
| 1508.0 | 93.606 |
| 1509.0 | 93.606 |
| 1510.0 | 93.606 |
| 1511.0 | 93.607 |
| 1512.0 | 93.607 |
| 1513.0 | 93.607 |
| 1514.0 | 93.607 |
| 1515.0 | 93.608 |
| 1516.0 | 93.608 |
| 1517.0 | 93.608 |
| 1518.0 | 93.608 |
| 1519.0 | 93.609 |
| 1520.0 | 93.609 |
| 1521.0 | 93.609 |
| 1522.0 | 93.609 |
| 1523.0 | 93.61 |
| 1524.0 | 93.61 |
| 1525.0 | 93.61 |
| 1526.0 | 93.611 |
| 1527.0 | 93.611 |
| 1528.0 | 93.611 |
| 1529.0 | 93.611 |
| 1530.0 | 93.612 |
| 1531.0 | 93.612 |
| 1532.0 | 93.612 |
| 1533.0 | 93.612 |
| 1534.0 | 93.613 |
| 1535.0 | 93.613 |
| 1536.0 | 93.613 |
| 1537.0 | 93.614 |
| 1538.0 | 93.614 |
| 1539.0 | 93.614 |
| 1540.0 | 93.614 |
| 1541.0 | 93.615 |
| 1542.0 | 93.615 |
| 1543.0 | 93.615 |
| 1544.0 | 93.615 |
| 1545.0 | 93.616 |
| 1546.0 | 93.616 |
| 1547.0 | 93.616 |
| 1548.0 | 93.617 |
| 1549.0 | 93.617 |
| 1550.0 | 93.617 |
| 1551.0 | 93.617 |
| 1552.0 | 93.618 |
| 1553.0 | 93.618 |
| 1554.0 | 93.618 |
| 1555.0 | 93.618 |
| 1556.0 | 93.619 |
| 1557.0 | 93.619 |
| 1558.0 | 93.619 |
| 1559.0 | 93.62 |
| 1560.0 | 93.62 |
| 1561.0 | 93.62 |
| 1562.0 | 93.62 |
| 1563.0 | 93.621 |
| 1564.0 | 93.621 |
| 1565.0 | 93.621 |
| 1566.0 | 93.621 |
| 1567.0 | 93.622 |
| 1568.0 | 93.622 |
| 1569.0 | 93.622 |
| 1570.0 | 93.623 |
| 1571.0 | 93.623 |
| 1572.0 | 93.623 |
| 1573.0 | 93.623 |
| 1574.0 | 93.624 |
| 1575.0 | 93.624 |
| 1576.0 | 93.624 |
| 1577.0 | 93.624 |
| 1578.0 | 93.625 |
| 1579.0 | 93.625 |
| 1580.0 | 93.625 |
| 1581.0 | 93.626 |
| 1582.0 | 93.626 |
| 1583.0 | 93.626 |
| 1584.0 | 93.626 |
| 1585.0 | 93.627 |
| 1586.0 | 93.627 |
| 1587.0 | 93.627 |
| 1588.0 | 93.627 |
| 1589.0 | 93.628 |
| 1590.0 | 93.628 |
| 1591.0 | 93.628 |
| 1592.0 | 93.629 |
| 1593.0 | 93.629 |
| 1594.0 | 93.629 |
| 1595.0 | 93.629 |
| 1596.0 | 93.63 |
| 1597.0 | 93.63 |
| 1598.0 | 93.63 |
| 1599.0 | 93.631 |
| 1600.0 | 93.631 |
| 1601.0 | 93.631 |
| 1602.0 | 93.631 |
| 1603.0 | 93.632 |
| 1604.0 | 93.632 |
| 1605.0 | 93.632 |
| 1606.0 | 93.632 |
| 1607.0 | 93.633 |
| 1608.0 | 93.633 |
| 1609.0 | 93.633 |
| 1610.0 | 93.634 |
| 1611.0 | 93.634 |
| 1612.0 | 93.634 |
| 1613.0 | 93.634 |
| 1614.0 | 93.635 |
| 1615.0 | 93.635 |
| 1616.0 | 93.635 |
| 1617.0 | 93.636 |
| 1618.0 | 93.636 |
| 1619.0 | 93.636 |
| 1620.0 | 93.636 |
| 1621.0 | 93.637 |
| 1622.0 | 93.637 |
| 1623.0 | 93.637 |
| 1624.0 | 93.637 |
| 1625.0 | 93.638 |
| 1626.0 | 93.638 |
| 1627.0 | 93.638 |
| 1628.0 | 93.639 |
| 1629.0 | 93.639 |
| 1630.0 | 93.639 |
| 1631.0 | 93.639 |
| 1632.0 | 93.64 |
| 1633.0 | 93.64 |
| 1634.0 | 93.64 |
| 1635.0 | 93.641 |
| 1636.0 | 93.641 |
| 1637.0 | 93.641 |
| 1638.0 | 93.641 |
| 1639.0 | 93.642 |
| 1640.0 | 93.642 |
| 1641.0 | 93.642 |
| 1642.0 | 93.643 |
| 1643.0 | 93.643 |
| 1644.0 | 93.643 |
| 1645.0 | 93.643 |
| 1646.0 | 93.644 |
| 1647.0 | 93.644 |
| 1648.0 | 93.644 |
| 1649.0 | 93.644 |
| 1650.0 | 93.645 |
| 1651.0 | 93.645 |
| 1652.0 | 93.645 |
| 1653.0 | 93.646 |
| 1654.0 | 93.646 |
| 1655.0 | 93.646 |
| 1656.0 | 93.646 |
| 1657.0 | 93.647 |
| 1658.0 | 93.647 |
| 1659.0 | 93.647 |
| 1660.0 | 93.648 |
| 1661.0 | 93.648 |
| 1662.0 | 93.648 |
| 1663.0 | 93.648 |
| 1664.0 | 93.649 |
| 1665.0 | 93.649 |
| 1666.0 | 93.649 |
| 1667.0 | 93.65 |
| 1668.0 | 93.65 |
| 1669.0 | 93.65 |
| 1670.0 | 93.65 |
| 1671.0 | 93.651 |
| 1672.0 | 93.651 |
| 1673.0 | 93.651 |
| 1674.0 | 93.652 |
| 1675.0 | 93.652 |
| 1676.0 | 93.652 |
| 1677.0 | 93.652 |
| 1678.0 | 93.653 |
| 1679.0 | 93.653 |
| 1680.0 | 93.653 |
| 1681.0 | 93.654 |
| 1682.0 | 93.654 |
| 1683.0 | 93.654 |
| 1684.0 | 93.654 |
| 1685.0 | 93.655 |
| 1686.0 | 93.655 |
| 1687.0 | 93.655 |
| 1688.0 | 93.656 |
| 1689.0 | 93.656 |
| 1690.0 | 93.656 |
| 1691.0 | 93.656 |
| 1692.0 | 93.657 |
| 1693.0 | 93.657 |
| 1694.0 | 93.657 |
| 1695.0 | 93.658 |
| 1696.0 | 93.658 |
| 1697.0 | 93.658 |
| 1698.0 | 93.658 |
| 1699.0 | 93.659 |
| 1700.0 | 93.659 |
| 1701.0 | 93.659 |
| 1702.0 | 93.66 |
| 1703.0 | 93.66 |
| 1704.0 | 93.66 |
| 1705.0 | 93.66 |
| 1706.0 | 93.661 |
| 1707.0 | 93.661 |
| 1708.0 | 93.661 |
| 1709.0 | 93.662 |
| 1710.0 | 93.662 |
| 1711.0 | 93.662 |
| 1712.0 | 93.663 |
| 1713.0 | 93.663 |
| 1714.0 | 93.663 |
| 1715.0 | 93.663 |
| 1716.0 | 93.664 |
| 1717.0 | 93.664 |
| 1718.0 | 93.664 |
| 1719.0 | 93.665 |
| 1720.0 | 93.665 |
| 1721.0 | 93.665 |
| 1722.0 | 93.665 |
| 1723.0 | 93.666 |
| 1724.0 | 93.666 |
| 1725.0 | 93.666 |
| 1726.0 | 93.667 |
| 1727.0 | 93.667 |
| 1728.0 | 93.667 |
| 1729.0 | 93.667 |
| 1730.0 | 93.668 |
| 1731.0 | 93.668 |
| 1732.0 | 93.668 |
| 1733.0 | 93.669 |
| 1734.0 | 93.669 |
| 1735.0 | 93.669 |
| 1736.0 | 93.67 |
| 1737.0 | 93.67 |
| 1738.0 | 93.67 |
| 1739.0 | 93.67 |
| 1740.0 | 93.671 |
| 1741.0 | 93.671 |
| 1742.0 | 93.671 |
| 1743.0 | 93.672 |
| 1744.0 | 93.672 |
| 1745.0 | 93.672 |
| 1746.0 | 93.672 |
| 1747.0 | 93.673 |
| 1748.0 | 93.673 |
| 1749.0 | 93.673 |
| 1750.0 | 93.674 |
| 1751.0 | 93.674 |
| 1752.0 | 93.674 |
| 1753.0 | 93.675 |
| 1754.0 | 93.675 |
| 1755.0 | 93.675 |
| 1756.0 | 93.675 |
| 1757.0 | 93.676 |
| 1758.0 | 93.676 |
| 1759.0 | 93.676 |
| 1760.0 | 93.677 |
| 1761.0 | 93.677 |
| 1762.0 | 93.677 |
| 1763.0 | 93.677 |
| 1764.0 | 93.678 |
| 1765.0 | 93.678 |
| 1766.0 | 93.678 |
| 1767.0 | 93.679 |
| 1768.0 | 93.679 |
| 1769.0 | 93.679 |
| 1770.0 | 93.68 |
| 1771.0 | 93.68 |
| 1772.0 | 93.68 |
| 1773.0 | 93.68 |
| 1774.0 | 93.681 |
| 1775.0 | 93.681 |
| 1776.0 | 93.681 |
| 1777.0 | 93.682 |
| 1778.0 | 93.682 |
| 1779.0 | 93.682 |
| 1780.0 | 93.683 |
| 1781.0 | 93.683 |
| 1782.0 | 93.683 |
| 1783.0 | 93.683 |
| 1784.0 | 93.684 |
| 1785.0 | 93.684 |
| 1786.0 | 93.684 |
| 1787.0 | 93.685 |
| 1788.0 | 93.685 |
| 1789.0 | 93.685 |
| 1790.0 | 93.686 |
| 1791.0 | 93.686 |
| 1792.0 | 93.686 |
| 1793.0 | 93.686 |
| 1794.0 | 93.687 |
| 1795.0 | 93.687 |
| 1796.0 | 93.687 |
| 1797.0 | 93.688 |
| 1798.0 | 93.688 |
| 1799.0 | 93.688 |
| 1800.0 | 93.689 |
| 1801.0 | 93.689 |
| 1802.0 | 93.689 |
| 1803.0 | 93.689 |
| 1804.0 | 93.69 |
| 1805.0 | 93.69 |
| 1806.0 | 93.69 |
| 1807.0 | 93.691 |
| 1808.0 | 93.691 |
| 1809.0 | 93.691 |
| 1810.0 | 93.692 |
| 1811.0 | 93.692 |
| 1812.0 | 93.692 |
| 1813.0 | 93.692 |
| 1814.0 | 93.693 |
| 1815.0 | 93.693 |
| 1816.0 | 93.693 |
| 1817.0 | 93.694 |
| 1818.0 | 93.694 |
| 1819.0 | 93.694 |
| 1820.0 | 93.695 |
| 1821.0 | 93.695 |
| 1822.0 | 93.695 |
| 1823.0 | 93.695 |
| 1824.0 | 93.696 |
| 1825.0 | 93.696 |
| 1826.0 | 93.696 |
| 1827.0 | 93.697 |
| 1828.0 | 93.697 |
| 1829.0 | 93.697 |
| 1830.0 | 93.698 |
| 1831.0 | 93.698 |
| 1832.0 | 93.698 |
| 1833.0 | 93.699 |
| 1834.0 | 93.699 |
| 1835.0 | 93.699 |
| 1836.0 | 93.699 |
| 1837.0 | 93.7 |
| 1838.0 | 93.7 |
| 1839.0 | 93.7 |
| 1840.0 | 93.701 |
| 1841.0 | 93.701 |
| 1842.0 | 93.701 |
| 1843.0 | 93.702 |
| 1844.0 | 93.702 |
| 1845.0 | 93.702 |
| 1846.0 | 93.703 |
| 1847.0 | 93.703 |
| 1848.0 | 93.703 |
| 1849.0 | 93.703 |
| 1850.0 | 93.704 |
| 1851.0 | 93.704 |
| 1852.0 | 93.704 |
| 1853.0 | 93.705 |
| 1854.0 | 93.705 |
| 1855.0 | 93.705 |
| 1856.0 | 93.706 |
| 1857.0 | 93.706 |
| 1858.0 | 93.706 |
| 1859.0 | 93.707 |
| 1860.0 | 93.707 |
| 1861.0 | 93.707 |
| 1862.0 | 93.707 |
| 1863.0 | 93.708 |
| 1864.0 | 93.708 |
| 1865.0 | 93.708 |
| 1866.0 | 93.709 |
| 1867.0 | 93.709 |
| 1868.0 | 93.709 |
| 1869.0 | 93.71 |
| 1870.0 | 93.71 |
| 1871.0 | 93.71 |
| 1872.0 | 93.711 |
| 1873.0 | 93.711 |
| 1874.0 | 93.711 |
| 1875.0 | 93.712 |
| 1876.0 | 93.712 |
| 1877.0 | 93.712 |
| 1878.0 | 93.712 |
| 1879.0 | 93.713 |
| 1880.0 | 93.713 |
| 1881.0 | 93.713 |
| 1882.0 | 93.714 |
| 1883.0 | 93.714 |
| 1884.0 | 93.714 |
| 1885.0 | 93.715 |
| 1886.0 | 93.715 |
| 1887.0 | 93.715 |
| 1888.0 | 93.716 |
| 1889.0 | 93.716 |
| 1890.0 | 93.716 |
| 1891.0 | 93.717 |
| 1892.0 | 93.717 |
| 1893.0 | 93.717 |
| 1894.0 | 93.717 |
| 1895.0 | 93.718 |
| 1896.0 | 93.718 |
| 1897.0 | 93.718 |
| 1898.0 | 93.719 |
| 1899.0 | 93.719 |
| 1900.0 | 93.719 |
| 1901.0 | 93.72 |
| 1902.0 | 93.72 |
| 1903.0 | 93.72 |
| 1904.0 | 93.721 |
| 1905.0 | 93.721 |
| 1906.0 | 93.721 |
| 1907.0 | 93.722 |
| 1908.0 | 93.722 |
| 1909.0 | 93.722 |
| 1910.0 | 93.723 |
| 1911.0 | 93.723 |
| 1912.0 | 93.723 |
| 1913.0 | 93.723 |
| 1914.0 | 93.724 |
| 1915.0 | 93.724 |
| 1916.0 | 93.724 |
| 1917.0 | 93.725 |
| 1918.0 | 93.725 |
| 1919.0 | 93.725 |
| 1920.0 | 93.726 |
| 1921.0 | 93.726 |
| 1922.0 | 93.726 |
| 1923.0 | 93.727 |
| 1924.0 | 93.727 |
| 1925.0 | 93.727 |
| 1926.0 | 93.728 |
| 1927.0 | 93.728 |
| 1928.0 | 93.728 |
| 1929.0 | 93.729 |
| 1930.0 | 93.729 |
| 1931.0 | 93.729 |
| 1932.0 | 93.73 |
| 1933.0 | 93.73 |
| 1934.0 | 93.73 |
| 1935.0 | 93.73 |
| 1936.0 | 93.731 |
| 1937.0 | 93.731 |
| 1938.0 | 93.731 |
| 1939.0 | 93.732 |
| 1940.0 | 93.732 |
| 1941.0 | 93.732 |
| 1942.0 | 93.733 |
| 1943.0 | 93.733 |
| 1944.0 | 93.733 |
| 1945.0 | 93.734 |
| 1946.0 | 93.734 |
| 1947.0 | 93.734 |
| 1948.0 | 93.735 |
| 1949.0 | 93.735 |
| 1950.0 | 93.735 |
| 1951.0 | 93.736 |
| 1952.0 | 93.736 |
| 1953.0 | 93.736 |
| 1954.0 | 93.737 |
| 1955.0 | 93.737 |
| 1956.0 | 93.737 |
| 1957.0 | 93.738 |
| 1958.0 | 93.738 |
| 1959.0 | 93.738 |
| 1960.0 | 93.739 |
| 1961.0 | 93.739 |
| 1962.0 | 93.739 |
| 1963.0 | 93.74 |
| 1964.0 | 93.74 |
| 1965.0 | 93.74 |
| 1966.0 | 93.74 |
| 1967.0 | 93.741 |
| 1968.0 | 93.741 |
| 1969.0 | 93.741 |
| 1970.0 | 93.742 |
| 1971.0 | 93.742 |
| 1972.0 | 93.742 |
| 1973.0 | 93.743 |
| 1974.0 | 93.743 |
| 1975.0 | 93.743 |
| 1976.0 | 93.744 |
| 1977.0 | 93.744 |
| 1978.0 | 93.744 |
| 1979.0 | 93.745 |
| 1980.0 | 93.745 |
| 1981.0 | 93.745 |
| 1982.0 | 93.746 |
| 1983.0 | 93.746 |
| 1984.0 | 93.746 |
| 1985.0 | 93.747 |
| 1986.0 | 93.747 |
| 1987.0 | 93.747 |
| 1988.0 | 93.748 |
| 1989.0 | 93.748 |
| 1990.0 | 93.748 |
| 1991.0 | 93.749 |
| 1992.0 | 93.749 |
| 1993.0 | 93.749 |
| 1994.0 | 93.75 |
| 1995.0 | 93.75 |
| 1996.0 | 93.75 |
| 1997.0 | 93.751 |
| 1998.0 | 93.751 |
| 1999.0 | 93.751 |
| 2000.0 | 93.752 |
| 2001.0 | 93.752 |
| 2002.0 | 93.752 |
| 2003.0 | 93.753 |
| 2004.0 | 93.753 |
| 2005.0 | 93.753 |
| 2006.0 | 93.754 |
| 2007.0 | 93.754 |
| 2008.0 | 93.754 |
| 2009.0 | 93.755 |
| 2010.0 | 93.755 |
| 2011.0 | 93.755 |
| 2012.0 | 93.756 |
| 2013.0 | 93.756 |
| 2014.0 | 93.756 |
| 2015.0 | 93.757 |
| 2016.0 | 93.757 |
| 2017.0 | 93.757 |
| 2018.0 | 93.758 |
| 2019.0 | 93.758 |
| 2020.0 | 93.758 |
| 2021.0 | 93.759 |
| 2022.0 | 93.759 |
| 2023.0 | 93.759 |
| 2024.0 | 93.76 |
| 2025.0 | 93.76 |
| 2026.0 | 93.76 |
| 2027.0 | 93.771 |
| 2028.0 | 93.743 |
| 2029.0 | 93.716 |
| 2030.0 | 93.704 |
| 2031.0 | 93.681 |
| 2032.0 | 93.653 |
| 2033.0 | 93.621 |
| 2034.0 | 93.595 |
| 2035.0 | 93.573 |
| 2036.0 | 93.545 |
| 2037.0 | 93.511 |
| 2038.0 | 93.49 |
| 2039.0 | 93.489 |
| 2040.0 | 93.478 |
| 2041.0 | 93.468 |
| 2042.0 | 93.435 |
| 2043.0 | 93.411 |
| 2044.0 | 93.381 |
| 2045.0 | 93.335 |
| 2046.0 | 93.311 |
| 2047.0 | 93.298 |
| 2048.0 | 93.273 |
| 2049.0 | 93.251 |
| 2050.0 | 93.249 |
| 2051.0 | 93.227 |
| 2052.0 | 93.201 |
| 2053.0 | 93.194 |
| 2054.0 | 93.181 |
| 2055.0 | 93.175 |
| 2056.0 | 93.163 |
| 2057.0 | 93.18 |
| 2058.0 | 93.17 |
| 2059.0 | 93.143 |
| 2060.0 | 93.118 |
| 2061.0 | 93.113 |
| 2062.0 | 93.085 |
| 2063.0 | 93.081 |
| 2064.0 | 93.105 |
| 2065.0 | 93.113 |
| 2066.0 | 93.099 |
| 2067.0 | 93.1 |
| 2068.0 | 93.109 |
| 2069.0 | 93.129 |
| 2070.0 | 93.111 |
| 2071.0 | 93.107 |
| 2072.0 | 93.112 |
| 2073.0 | 93.114 |
| 2074.0 | 93.119 |
| 2075.0 | 93.13 |
| 2076.0 | 93.141 |
| 2077.0 | 93.143 |
| 2078.0 | 93.129 |
| 2079.0 | 93.137 |
| 2080.0 | 93.144 |
| 2081.0 | 93.166 |
| 2082.0 | 93.164 |
| 2083.0 | 93.164 |
| 2084.0 | 93.17 |
| 2085.0 | 93.161 |
| 2086.0 | 93.166 |
| 2087.0 | 93.158 |
| 2088.0 | 93.151 |
| 2089.0 | 93.148 |
| 2090.0 | 93.133 |
| 2091.0 | 93.124 |
| 2092.0 | 93.109 |
| 2093.0 | 93.103 |
| 2094.0 | 93.089 |
| 2095.0 | 93.082 |
| 2096.0 | 93.082 |
| 2097.0 | 93.05 |
| 2098.0 | 93.034 |
| 2099.0 | 93.035 |
| 2100.0 | 93.025 |
| 2101.0 | 93.039 |
| 2102.0 | 93.007 |
| 2103.0 | 92.974 |
| 2104.0 | 92.968 |
| 2105.0 | 92.948 |
| 2106.0 | 92.938 |
| 2107.0 | 92.924 |
| 2108.0 | 92.904 |
| 2109.0 | 92.892 |
| 2110.0 | 92.869 |
| 2111.0 | 92.839 |
| 2112.0 | 92.815 |
| 2113.0 | 92.798 |
| 2114.0 | 92.78 |
| 2115.0 | 92.756 |
| 2116.0 | 92.741 |
| 2117.0 | 92.719 |
| 2118.0 | 92.689 |
| 2119.0 | 92.673 |
| 2120.0 | 92.656 |
| 2121.0 | 92.618 |
| 2122.0 | 92.583 |
| 2123.0 | 92.554 |
| 2124.0 | 92.503 |
| 2125.0 | 92.491 |
| 2126.0 | 92.44 |
| 2127.0 | 92.405 |
| 2128.0 | 92.369 |
| 2129.0 | 92.328 |
| 2130.0 | 92.291 |
| 2131.0 | 92.218 |
| 2132.0 | 92.164 |
| 2133.0 | 92.122 |
| 2134.0 | 92.075 |
| 2135.0 | 92 |
| 2136.0 | 91.921 |
| 2137.0 | 91.872 |
| 2138.0 | 91.771 |
| 2139.0 | 91.69 |
| 2140.0 | 91.591 |
| 2141.0 | 91.49 |
| 2142.0 | 91.394 |
| 2143.0 | 91.293 |
| 2144.0 | 91.219 |
| 2145.0 | 91.069 |
| 2146.0 | 90.944 |
| 2147.0 | 90.821 |
| 2148.0 | 90.685 |
| 2149.0 | 90.58 |
| 2150.0 | 90.462 |
| 2151.0 | 90.31 |
| 2152.0 | 90.2 |
| 2153.0 | 90.072 |
| 2154.0 | 89.953 |
| 2155.0 | 89.831 |
| 2156.0 | 89.72 |
| 2157.0 | 89.605 |
| 2158.0 | 89.488 |
| 2159.0 | 89.368 |
| 2160.0 | 89.266 |
| 2161.0 | 89.136 |
| 2162.0 | 89.006 |
| 2163.0 | 88.893 |
| 2164.0 | 88.762 |
| 2165.0 | 88.629 |
| 2166.0 | 88.504 |
| 2167.0 | 88.347 |
| 2168.0 | 88.188 |
| 2169.0 | 88.036 |
| 2170.0 | 87.903 |
| 2171.0 | 87.73 |
| 2172.0 | 87.521 |
| 2173.0 | 87.329 |
| 2174.0 | 87.112 |
| 2175.0 | 86.879 |
| 2176.0 | 86.622 |
| 2177.0 | 86.35 |
| 2178.0 | 86.081 |
| 2179.0 | 85.75 |
| 2180.0 | 85.453 |
| 2181.0 | 85.04 |
| 2182.0 | 84.624 |
| 2183.0 | 84.137 |
| 2184.0 | 83.672 |
| 2185.0 | 83.108 |
| 2186.0 | 82.424 |
| 2187.0 | 81.724 |
| 2188.0 | 80.913 |
| 2189.0 | 80.044 |
| 2190.0 | 79.142 |
| 2191.0 | 78.046 |
| 2192.0 | 76.904 |
| 2193.0 | 75.736 |
| 2194.0 | 74.467 |
| 2195.0 | 73.13 |
| 2196.0 | 71.675 |
| 2197.0 | 70.197 |
| 2198.0 | 68.86 |
| 2199.0 | 67.44 |
| 2200.0 | 65.969 |
| 2201.0 | 64.681 |
| 2202.0 | 63.517 |
| 2203.0 | 62.382 |
| 2204.0 | 61.394 |
| 2205.0 | 60.584 |
| 2206.0 | 59.899 |
| 2207.0 | 59.387 |
| 2208.0 | 58.939 |
| 2209.0 | 58.66 |
| 2210.0 | 58.513 |
| 2211.0 | 58.48 |
| 2212.0 | 58.532 |
| 2213.0 | 58.68 |
| 2214.0 | 58.917 |
| 2215.0 | 59.22 |
| 2216.0 | 59.557 |
| 2217.0 | 59.974 |
| 2218.0 | 60.378 |
| 2219.0 | 60.791 |
| 2220.0 | 61.219 |
| 2221.0 | 61.661 |
| 2222.0 | 62.113 |
| 2223.0 | 62.569 |
| 2224.0 | 62.992 |
| 2225.0 | 63.411 |
| 2226.0 | 63.818 |
| 2227.0 | 64.153 |
| 2228.0 | 64.48 |
| 2229.0 | 64.783 |
| 2230.0 | 65.037 |
| 2231.0 | 65.282 |
| 2232.0 | 65.464 |
| 2233.0 | 65.624 |
| 2234.0 | 65.81 |
| 2235.0 | 65.956 |
| 2236.0 | 66.094 |
| 2237.0 | 66.205 |
| 2238.0 | 66.329 |
| 2239.0 | 66.42 |
| 2240.0 | 66.505 |
| 2241.0 | 66.606 |
| 2242.0 | 66.71 |
| 2243.0 | 66.831 |
| 2244.0 | 66.945 |
| 2245.0 | 67.092 |
| 2246.0 | 67.249 |
| 2247.0 | 67.425 |
| 2248.0 | 67.596 |
| 2249.0 | 67.788 |
| 2250.0 | 67.975 |
| 2251.0 | 68.222 |
| 2252.0 | 68.475 |
| 2253.0 | 68.732 |
| 2254.0 | 69.009 |
| 2255.0 | 69.308 |
| 2256.0 | 69.606 |
| 2257.0 | 69.91 |
| 2258.0 | 70.233 |
| 2259.0 | 70.576 |
| 2260.0 | 70.918 |
| 2261.0 | 71.279 |
| 2262.0 | 71.635 |
| 2263.0 | 72.012 |
| 2264.0 | 72.386 |
| 2265.0 | 72.788 |
| 2266.0 | 73.177 |
| 2267.0 | 73.569 |
| 2268.0 | 73.961 |
| 2269.0 | 74.352 |
| 2270.0 | 74.73 |
| 2271.0 | 75.125 |
| 2272.0 | 75.498 |
| 2273.0 | 75.87 |
| 2274.0 | 76.238 |
| 2275.0 | 76.595 |
| 2276.0 | 76.955 |
| 2277.0 | 77.32 |
| 2278.0 | 77.685 |
| 2279.0 | 78.033 |
| 2280.0 | 78.379 |
| 2281.0 | 78.736 |
| 2282.0 | 79.049 |
| 2283.0 | 79.384 |
| 2284.0 | 79.701 |
| 2285.0 | 79.967 |
| 2286.0 | 80.271 |
| 2287.0 | 80.574 |
| 2288.0 | 80.862 |
| 2289.0 | 81.15 |
| 2290.0 | 81.428 |
| 2291.0 | 81.708 |
| 2292.0 | 81.973 |
| 2293.0 | 82.239 |
| 2294.0 | 82.465 |
| 2295.0 | 82.692 |
| 2296.0 | 82.952 |
| 2297.0 | 83.203 |
| 2298.0 | 83.429 |
| 2299.0 | 83.653 |
| 2300.0 | 83.882 |
| 2301.0 | 84.112 |
| 2302.0 | 84.312 |
| 2303.0 | 84.523 |
| 2304.0 | 84.731 |
| 2305.0 | 84.916 |
| 2306.0 | 85.111 |
| 2307.0 | 85.311 |
| 2308.0 | 85.504 |
| 2309.0 | 85.676 |
| 2310.0 | 85.849 |
| 2311.0 | 86 |
| 2312.0 | 86.127 |
| 2313.0 | 86.28 |
| 2314.0 | 86.428 |
| 2315.0 | 86.572 |
| 2316.0 | 86.712 |
| 2317.0 | 86.871 |
| 2318.0 | 87.009 |
| 2319.0 | 87.125 |
| 2320.0 | 87.218 |
| 2321.0 | 87.347 |
| 2322.0 | 87.474 |
| 2323.0 | 87.568 |
| 2324.0 | 87.662 |
| 2325.0 | 87.769 |
| 2326.0 | 87.876 |
| 2327.0 | 87.95 |
| 2328.0 | 88.029 |
| 2329.0 | 88.117 |
| 2330.0 | 88.182 |
| 2331.0 | 88.257 |
| 2332.0 | 88.32 |
| 2333.0 | 88.373 |
| 2334.0 | 88.471 |
| 2335.0 | 88.564 |
| 2336.0 | 88.602 |
| 2337.0 | 88.665 |
| 2338.0 | 88.704 |
| 2339.0 | 88.752 |
| 2340.0 | 88.821 |
| 2341.0 | 88.877 |
| 2342.0 | 88.94 |
| 2343.0 | 88.975 |
| 2344.0 | 89.018 |
| 2345.0 | 89.067 |
| 2346.0 | 89.14 |
| 2347.0 | 89.167 |
| 2348.0 | 89.207 |
| 2349.0 | 89.245 |
| 2350.0 | 89.26 |
| 2351.0 | 89.272 |
| 2352.0 | 89.301 |
| 2353.0 | 89.325 |
| 2354.0 | 89.336 |
| 2355.0 | 89.379 |
| 2356.0 | 89.414 |
| 2357.0 | 89.439 |
| 2358.0 | 89.463 |
| 2359.0 | 89.483 |
| 2360.0 | 89.486 |
| 2361.0 | 89.495 |
| 2362.0 | 89.511 |
| 2363.0 | 89.54 |
| 2364.0 | 89.555 |
| 2365.0 | 89.565 |
| 2366.0 | 89.566 |
| 2367.0 | 89.572 |
| 2368.0 | 89.599 |
| 2369.0 | 89.605 |
| 2370.0 | 89.593 |
| 2371.0 | 89.599 |
| 2372.0 | 89.597 |
| 2373.0 | 89.62 |
| 2374.0 | 89.632 |
| 2375.0 | 89.617 |
| 2376.0 | 89.595 |
| 2377.0 | 89.574 |
| 2378.0 | 89.588 |
| 2379.0 | 89.603 |
| 2380.0 | 89.592 |
| 2381.0 | 89.559 |
| 2382.0 | 89.539 |
| 2383.0 | 89.526 |
| 2384.0 | 89.508 |
| 2385.0 | 89.484 |
| 2386.0 | 89.464 |
| 2387.0 | 89.431 |
| 2388.0 | 89.391 |
| 2389.0 | 89.359 |
| 2390.0 | 89.329 |
| 2391.0 | 89.302 |
| 2392.0 | 89.257 |
| 2393.0 | 89.185 |
| 2394.0 | 89.111 |
| 2395.0 | 89.046 |
| 2396.0 | 88.982 |
| 2397.0 | 88.928 |
| 2398.0 | 88.85 |
| 2399.0 | 88.777 |
| 2400.0 | 88.722 |
| 2401.0 | 88.638 |
| 2402.0 | 88.54 |
| 2403.0 | 88.461 |
| 2404.0 | 88.39 |
| 2405.0 | 88.31 |
| 2406.0 | 88.234 |
| 2407.0 | 88.148 |
| 2408.0 | 88.05 |
| 2409.0 | 87.959 |
| 2410.0 | 87.863 |
| 2411.0 | 87.771 |
| 2412.0 | 87.689 |
| 2413.0 | 87.6 |
| 2414.0 | 87.505 |
| 2415.0 | 87.399 |
| 2416.0 | 87.31 |
| 2417.0 | 87.216 |
| 2418.0 | 87.107 |
| 2419.0 | 87.022 |
| 2420.0 | 86.936 |
| 2421.0 | 86.827 |
| 2422.0 | 86.694 |
| 2423.0 | 86.566 |
| 2424.0 | 86.473 |
| 2425.0 | 86.381 |
| 2426.0 | 86.265 |
| 2427.0 | 86.171 |
| 2428.0 | 86.073 |
| 2429.0 | 85.946 |
| 2430.0 | 85.826 |
| 2431.0 | 85.719 |
| 2432.0 | 85.597 |
| 2433.0 | 85.474 |
| 2434.0 | 85.35 |
| 2435.0 | 85.237 |
| 2436.0 | 85.135 |
| 2437.0 | 85.026 |
| 2438.0 | 84.934 |
| 2439.0 | 84.831 |
| 2440.0 | 84.695 |
| 2441.0 | 84.566 |
| 2442.0 | 84.46 |
| 2443.0 | 84.361 |
| 2444.0 | 84.264 |
| 2445.0 | 84.163 |
| 2446.0 | 84.036 |
| 2447.0 | 83.932 |
| 2448.0 | 83.834 |
| 2449.0 | 83.716 |
| 2450.0 | 83.612 |
| 2451.0 | 83.523 |
| 2452.0 | 83.432 |
| 2453.0 | 83.329 |
| 2454.0 | 83.226 |
| 2455.0 | 83.123 |
| 2456.0 | 82.996 |
| 2457.0 | 82.882 |
| 2458.0 | 82.777 |
| 2459.0 | 82.681 |
| 2460.0 | 82.586 |
| 2461.0 | 82.487 |
| 2462.0 | 82.385 |
| 2463.0 | 82.272 |
| 2464.0 | 82.146 |
| 2465.0 | 82.026 |
| 2466.0 | 81.932 |
| 2467.0 | 81.818 |
| 2468.0 | 81.672 |
| 2469.0 | 81.538 |
| 2470.0 | 81.419 |
| 2471.0 | 81.302 |
| 2472.0 | 81.179 |
| 2473.0 | 81.047 |
| 2474.0 | 80.909 |
| 2475.0 | 80.783 |
| 2476.0 | 80.658 |
| 2477.0 | 80.503 |
| 2478.0 | 80.346 |
| 2479.0 | 80.213 |
| 2480.0 | 80.075 |
| 2481.0 | 79.915 |
| 2482.0 | 79.752 |
| 2483.0 | 79.613 |
| 2484.0 | 79.462 |
| 2485.0 | 79.29 |
| 2486.0 | 79.126 |
| 2487.0 | 78.949 |
| 2488.0 | 78.774 |
| 2489.0 | 78.582 |
| 2490.0 | 78.412 |
| 2491.0 | 78.226 |
| 2492.0 | 78.058 |
| 2493.0 | 77.874 |
| 2494.0 | 77.692 |
| 2495.0 | 77.495 |
| 2496.0 | 77.293 |
| 2497.0 | 77.101 |
| 2498.0 | 76.909 |
| 2499.0 | 76.701 |
| 2500.0 | 76.498 |
| 2501.0 | 76.274 |
| 2502.0 | 76.047 |
| 2503.0 | 75.828 |
| 2504.0 | 75.6 |
| 2505.0 | 75.342 |
| 2506.0 | 75.093 |
| 2507.0 | 74.856 |
| 2508.0 | 74.623 |
| 2509.0 | 74.391 |
| 2510.0 | 74.159 |
| 2511.0 | 73.872 |
| 2512.0 | 73.615 |
| 2513.0 | 73.356 |
| 2514.0 | 73.126 |
| 2515.0 | 72.858 |
| 2516.0 | 72.564 |
| 2517.0 | 72.292 |
| 2518.0 | 72.028 |
| 2519.0 | 71.748 |
| 2520.0 | 71.483 |
| 2521.0 | 71.18 |
| 2522.0 | 70.912 |
| 2523.0 | 70.665 |
| 2524.0 | 70.382 |
| 2525.0 | 70.11 |
| 2526.0 | 69.835 |
| 2527.0 | 69.552 |
| 2528.0 | 69.266 |
| 2529.0 | 69.003 |
| 2530.0 | 68.714 |
| 2531.0 | 68.429 |
| 2532.0 | 68.105 |
| 2533.0 | 67.813 |
| 2534.0 | 67.497 |
| 2535.0 | 67.188 |
| 2536.0 | 66.902 |
| 2537.0 | 66.624 |
| 2538.0 | 66.345 |
| 2539.0 | 66.069 |
| 2540.0 | 65.792 |
| 2541.0 | 65.511 |
| 2542.0 | 65.226 |
| 2543.0 | 64.91 |
| 2544.0 | 64.615 |
| 2545.0 | 64.299 |
| 2546.0 | 63.992 |
| 2547.0 | 63.666 |
| 2548.0 | 63.358 |
| 2549.0 | 63.042 |
| 2550.0 | 62.734 |
| 2551.0 | 62.459 |
| 2552.0 | 62.187 |
| 2553.0 | 61.943 |
| 2554.0 | 61.691 |
| 2555.0 | 61.436 |
| 2556.0 | 61.207 |
| 2557.0 | 60.927 |
| 2558.0 | 60.68 |
| 2559.0 | 60.434 |
| 2560.0 | 60.191 |
| 2561.0 | 59.903 |
| 2562.0 | 59.639 |
| 2563.0 | 59.344 |
| 2564.0 | 59.043 |
| 2565.0 | 58.748 |
| 2566.0 | 58.49 |
| 2567.0 | 58.225 |
| 2568.0 | 57.952 |
| 2569.0 | 57.718 |
| 2570.0 | 57.474 |
| 2571.0 | 57.245 |
| 2572.0 | 57.054 |
| 2573.0 | 56.824 |
| 2574.0 | 56.625 |
| 2575.0 | 56.389 |
| 2576.0 | 56.168 |
| 2577.0 | 55.98 |
| 2578.0 | 55.759 |
| 2579.0 | 55.538 |
| 2580.0 | 55.315 |
| 2581.0 | 55.081 |
| 2582.0 | 54.837 |
| 2583.0 | 54.666 |
| 2584.0 | 54.471 |
| 2585.0 | 54.255 |
| 2586.0 | 54.067 |
| 2587.0 | 53.845 |
| 2588.0 | 53.649 |
| 2589.0 | 53.409 |
| 2590.0 | 53.165 |
| 2591.0 | 52.951 |
| 2592.0 | 52.785 |
| 2593.0 | 52.592 |
| 2594.0 | 52.429 |
| 2595.0 | 52.232 |
| 2596.0 | 52.052 |
| 2597.0 | 51.873 |
| 2598.0 | 51.711 |
| 2599.0 | 51.472 |
| 2600.0 | 51.324 |
| 2600.67806 | 49.595 |
| 2601.78287 | 49.897 |
| 2602.88762 | 49.46 |
| 2603.71616 | 49.327 |
| 2604.82083 | 48.89 |
| 2605.92545 | 48.597 |
| 2606.75388 | 49.013 |
| 2607.85841 | 48.587 |
| 2608.68678 | 48.149 |
| 2609.79122 | 48.269 |
| 2610.89561 | 47.81 |
| 2611.72387 | 47.935 |
| 2612.82817 | 47.866 |
| 2613.93242 | 47.13 |
| 2614.76058 | 47.182 |
| 2615.86474 | 47.159 |
| 2616.69283 | 46.989 |
| 2617.7969 | 46.884 |
| 2618.90092 | 46.388 |
| 2619.7289 | 46.456 |
| 2620.83283 | 45.885 |
| 2621.66075 | 45.672 |
| 2622.76459 | 46.016 |
| 2623.86838 | 45.39 |
| 2624.69619 | 44.7 |
| 2625.7999 | 44.659 |
| 2626.90355 | 44.056 |
| 2627.73125 | 45.169 |
| 2628.83481 | 44.491 |
| 2629.66245 | 44.144 |
| 2630.76592 | 44.001 |
| 2631.86934 | 43.915 |
| 2632.69687 | 42.946 |
| 2633.8002 | 42.523 |
| 2634.90348 | 42.105 |
| 2635.73091 | 41.688 |
| 2636.83409 | 41.544 |
| 2637.66145 | 41.692 |
| 2638.76455 | 41.324 |
| 2639.8676 | 40.883 |
| 2640.69485 | 40.864 |
| 2641.79781 | 40.753 |
| 2642.90071 | 39.947 |
| 2643.72786 | 39.521 |
| 2644.83068 | 39.317 |
| 2645.65775 | 39.147 |
| 2646.76048 | 38.957 |
| 2647.86315 | 38.65 |
| 2648.69012 | 37.71 |
| 2649.79271 | 37.606 |
| 2650.89524 | 36.817 |
| 2651.72211 | 36.461 |
| 2652.82455 | 36.062 |
| 2653.65134 | 34.975 |
| 2654.75369 | 34.303 |
| 2655.85599 | 33.539 |
| 2656.68268 | 32.94 |
| 2657.78489 | 32.699 |
| 2658.88705 | 31.533 |
| 2659.71363 | 31.016 |
| 2660.8157 | 30.634 |
| 2661.64221 | 29.703 |
| 2662.74419 | 29.282 |
| 2663.84611 | 27.928 |
| 2664.67252 | 27.781 |
| 2665.77435 | 26.75 |
| 2666.87613 | 25.118 |
| 2667.70244 | 24.134 |
| 2668.80413 | 23.315 |
| 2669.90576 | 21.667 |
| 2670.73196 | 21.314 |
| 2671.8335 | 18.745 |
| 2672.65963 | 18.738 |
| 2673.76108 | 18.097 |
| 2674.86249 | 15.615 |
| 2675.6885 | 15.709 |
| 2676.78982 | 13.426 |
| 2677.89108 | 12.587 |
| 2678.71699 | 11.174 |
| 2679.81815 | 9.768 |
| 2680.644 | 9.283 |
| 2681.74507 | 7.963 |
| 2682.8461 | 6.809 |
| 2683.67183 | 6.693 |
| 2684.77276 | 5.331 |
| 2685.87365 | 4.78 |
| 2686.69927 | 4.679 |
| 2687.80006 | 4.028 |
| 2688.9008 | 2.916 |
| 2689.72631 | 2.635 |
| 2690.82696 | 2.182 |
| 2691.65241 | 1.456 |
| 2692.75296 | 1.59 |
| 2693.85346 | 0.702 |
| 2694.6788 | 0.469 |
| 2695.77921 | 0.726 |
| 2696.87957 | 0.195 |
| 2697.7048 | 0.77 |
| 2698.80506 | 1.571 |
| 2699.63023 | 0.433 |
| 2700.7304 | 0.192 |
| 2701.83052 | 0.215 |
| 2702.65557 | 0.082 |
| 2703.7556 | 0.041 |
| 2704.85557 | 0.066 |
| 2705.68052 | 0.354 |
| 2706.7804 | 0.681 |
| 2707.88023 | 0.882 |
| 2708.70507 | 0.482 |
| 2709.80481 | 0.282 |
| 2710.62957 | 0.096 |
| 2711.72922 | 0.3 |
| 2712.82881 | 0.109 |
| 2713.65347 | 0.056 |
| 2714.75297 | 0.593 |
| 2715.85241 | 0.509 |
| 2716.67696 | 0.044 |
| 2717.77632 | 0.337 |
| 2718.87562 | 0.068 |
| 2719.70006 | 0.272 |
| 2720.79927 | 0.501 |
| 2721.62364 | 0.332 |
| 2722.72275 | 0.665 |
| 2723.82181 | 0.163 |
| 2724.64607 | 0.005 |
| 2725.74504 | 0.333 |
| 2726.84396 | 0.247 |
| 2727.66811 | 0.057 |
| 2728.76693 | 0.139 |
| 2729.8657 | 0.54 |
| 2730.68974 | 0.8 |
| 2731.78842 | 0.483 |
| 2732.88704 | 0.259 |
| 2733.71098 | 0.303 |
| 2734.80951 | 0.087 |
| 2735.63337 | 0.123 |
| 2736.7318 | 0.669 |
| 2737.83019 | 0.174 |
| 2738.65394 | 0.098 |
| 2739.75223 | 0.129 |
| 2740.85047 | 0.28 |
| 2741.67411 | 0.301 |
| 2742.77225 | 0.285 |
| 2743.87034 | 0.343 |
| 2744.69387 | 0.424 |
| 2745.79187 | 0.05 |
| 2746.61533 | 0.496 |
| 2747.71323 | 0.304 |
| 2748.81108 | 0.085 |
| 2749.63443 | 0.762 |
| 2750.73218 | 0.31 |
| 2751.82988 | 0.902 |
| 2752.65312 | 0.777 |
| 2753.75073 | 1.11 |
| 2754.84829 | 1.137 |
| 2755.67141 | 1.119 |
| 2756.76887 | 0.811 |
| 2757.86628 | 0.866 |
| 2758.6893 | 1.024 |
| 2759.78661 | 0.898 |
| 2760.60956 | 0.589 |
| 2761.70678 | 1.104 |
| 2762.80394 | 1.145 |
| 2763.62678 | 1.175 |
| 2764.72385 | 1.63 |
| 2765.82086 | 1.216 |
| 2766.64359 | 0.641 |
| 2767.74051 | 0.734 |
| 2768.83737 | 0.61 |
| 2769.65999 | 0.544 |
| 2770.75676 | 0.793 |
| 2771.85348 | 0.393 |
| 2772.67598 | 0.558 |
| 2773.77261 | 0.831 |
| 2774.86918 | 1.337 |
| 2775.69157 | 1.115 |
| 2776.78804 | 0.671 |
| 2777.61036 | 0.799 |
| 2778.70675 | 0.789 |
| 2779.80307 | 0.458 |
| 2780.62528 | 0.918 |
| 2781.72151 | 0.06 |
| 2782.81769 | 0.271 |
| 2783.63979 | 0.92 |
| 2784.73587 | 0.997 |
| 2785.8319 | 0.842 |
| 2786.65388 | 0.521 |
| 2787.74981 | 0.534 |
| 2788.84569 | 0.906 |
| 2789.66757 | 0.432 |
| 2790.76335 | 0.709 |
| 2791.85908 | 0.806 |
| 2792.68084 | 0.762 |
| 2793.77647 | 0.901 |
| 2794.59816 | 0.833 |
| 2795.6937 | 0.537 |
| 2796.78918 | 0.646 |
| 2797.61076 | 0.462 |
| 2798.70615 | 0.821 |
| 2799.80148 | 0.178 |
| 2800.62295 | 0.434 |
| 2801.71819 | 0.389 |
| 2802.81337 | 0.295 |
| 2803.63472 | 0.303 |
| 2804.72981 | 0.808 |
| 2805.82484 | 0.513 |
| 2806.64608 | 0.16 |
| 2807.74102 | 0.475 |
| 2808.8359 | 0.574 |
| 2809.65703 | 0.438 |
| 2810.75181 | 0.359 |
| 2811.84655 | 0.13 |
| 2812.66756 | 0.086 |
| 2813.7622 | 0.164 |
| 2814.85678 | 0.143 |
| 2815.67768 | 0.167 |
| 2816.77216 | 0.089 |
| 2817.59299 | 0.849 |
| 2818.68738 | 1.05 |
| 2819.78171 | 1.765 |
| 2820.60243 | 2.037 |
| 2821.69667 | 1.964 |
| 2822.79085 | 1.826 |
| 2823.61145 | 1.796 |
| 2824.70554 | 2.196 |
| 2825.79957 | 2.93 |
| 2826.62006 | 2.496 |
| 2827.71399 | 3.014 |
| 2828.80787 | 2.657 |
| 2829.62825 | 3.103 |
| 2830.72203 | 3.632 |
| 2831.81576 | 3.193 |
| 2832.63602 | 3.212 |
| 2833.72965 | 3.981 |
| 2834.82323 | 4.715 |
| 2835.64337 | 4.673 |
| 2836.73685 | 5.278 |
| 2837.83028 | 5.78 |
| 2838.65031 | 5.89 |
| 2839.74364 | 5.965 |
| 2840.83691 | 6.725 |
| 2841.65683 | 7.175 |
| 2842.75 | 7.62 |
| 2843.84312 | 8.2 |
| 2844.66293 | 8.326 |
| 2845.75595 | 8.535 |
| 2846.84892 | 8.964 |
| 2847.66861 | 10.073 |
| 2848.76148 | 10.302 |
| 2849.58109 | 10.729 |
| 2850.67386 | 10.953 |
| 2851.76658 | 11.687 |
| 2852.58608 | 12.521 |
| 2853.6787 | 12.625 |
| 2854.77127 | 13.352 |
| 2855.59066 | 14.087 |
| 2856.68312 | 14.069 |
| 2857.77553 | 15.446 |
| 2858.59481 | 15.581 |
| 2859.68712 | 16.964 |
| 2860.77938 | 17.46 |
| 2861.59853 | 18.019 |
| 2862.6907 | 18.511 |
| 2863.7828 | 19.652 |
| 2864.60184 | 19.947 |
| 2865.69385 | 19.949 |
| 2866.7858 | 20.731 |
| 2867.60473 | 21.157 |
| 2868.69658 | 22.321 |
| 2869.78838 | 23.044 |
| 2870.60719 | 23.851 |
| 2871.69889 | 24.589 |
| 2872.79053 | 24.923 |
| 2873.60923 | 25.14 |
| 2874.70077 | 26.099 |
| 2875.79226 | 26.796 |
| 2876.61084 | 27.323 |
| 2877.70223 | 28.239 |
| 2878.79357 | 29.236 |
| 2879.61203 | 29.442 |
| 2880.70327 | 30.266 |
| 2881.79445 | 30.931 |
| 2882.6128 | 31.33 |
| 2883.70388 | 32.28 |
| 2884.79491 | 33.238 |
| 2885.61314 | 33.61 |
| 2886.70407 | 34.201 |
| 2887.79494 | 34.386 |
| 2888.61306 | 35.066 |
| 2889.70383 | 35.604 |
| 2890.79455 | 35.914 |
| 2891.61255 | 36.404 |
| 2892.70317 | 36.815 |
| 2893.79373 | 37.709 |
| 2894.61161 | 37.621 |
| 2895.70208 | 38.194 |
| 2896.79248 | 38.685 |
| 2897.61025 | 39.177 |
| 2898.70056 | 39.606 |
| 2899.79081 | 40.295 |
| 2900.60846 | 40.96 |
| 2901.69861 | 41.517 |
| 2902.78871 | 42.042 |
| 2903.60624 | 42.535 |
| 2904.69624 | 43.173 |
| 2905.78618 | 43.788 |
| 2906.6036 | 43.977 |
| 2907.69344 | 44.835 |
| 2908.78322 | 44.83 |
| 2909.60052 | 45.42 |
| 2910.69021 | 46.205 |
| 2911.77983 | 46.528 |
| 2912.59702 | 46.502 |
| 2913.68655 | 47.196 |
| 2914.77602 | 47.847 |
| 2915.59309 | 47.828 |
| 2916.68246 | 48.447 |
| 2917.77177 | 48.433 |
| 2918.58872 | 49.424 |
| 2919.67794 | 49.539 |
| 2920.7671 | 50.244 |
| 2921.58393 | 50.902 |
| 2922.67299 | 50.988 |
| 2923.76199 | 51.481 |
| 2924.57871 | 52.174 |
| 2925.66761 | 52.209 |
| 2926.75645 | 52.256 |
| 2927.57305 | 52.573 |
| 2928.6618 | 53.149 |
| 2929.75049 | 53.784 |
| 2930.56696 | 54.011 |
| 2931.65555 | 54.154 |
| 2932.74409 | 54.066 |
| 2933.56045 | 55.042 |
| 2934.64888 | 54.448 |
| 2935.73725 | 54.756 |
| 2936.5535 | 55.26 |
| 2937.64177 | 56.023 |
| 2938.72999 | 55.75 |
| 2939.81815 | 56.177 |
| 2940.63423 | 56.176 |
| 2941.72229 | 56.387 |
| 2942.81029 | 56.824 |
| 2943.62625 | 57.21 |
| 2944.71415 | 57.22 |
| 2945.802 | 57.207 |
| 2946.61784 | 58.323 |
| 2947.70559 | 58.217 |
| 2948.79327 | 58.645 |
| 2949.609 | 59.028 |
| 2950.69659 | 58.881 |
| 2951.78411 | 59.49 |
| 2952.59972 | 59.877 |
| 2953.68715 | 60.137 |
| 2954.77452 | 60.783 |
| 2955.59001 | 60.671 |
| 2956.67728 | 60.783 |
| 2957.76449 | 60.767 |
| 2958.57986 | 61.308 |
| 2959.66697 | 61.46 |
| 2960.75402 | 61.21 |
| 2961.56927 | 61.819 |
| 2962.65622 | 62.158 |
| 2963.74312 | 62.378 |
| 2964.55825 | 62.059 |
| 2965.64504 | 63.232 |
| 2966.73178 | 63.491 |
| 2967.54679 | 62.924 |
| 2968.63342 | 62.996 |
| 2969.72 | 63.826 |
| 2970.80652 | 63.909 |
| 2971.62137 | 63.588 |
| 2972.70779 | 64.479 |
| 2973.79414 | 64.04 |
| 2974.60887 | 64.8 |
| 2975.69513 | 64.879 |
| 2976.78133 | 65.096 |
| 2977.59594 | 64.944 |
| 2978.68204 | 64.887 |
| 2979.76808 | 65.09 |
| 2980.58257 | 65.77 |
| 2981.66851 | 65.566 |
| 2982.75439 | 65.672 |
| 2983.56876 | 65.896 |
| 2984.65454 | 66.19 |
| 2985.74026 | 66.344 |
| 2986.55451 | 66.297 |
| 2987.64013 | 66.217 |
| 2988.72568 | 66.567 |
| 2989.53982 | 66.9 |
| 2990.62527 | 66.876 |
| 2991.71067 | 66.96 |
| 2992.79601 | 67.018 |
| 2993.60998 | 67.842 |
| 2994.69522 | 67.971 |
| 2995.7804 | 68.14 |
| 2996.59425 | 68.214 |
| 2997.67932 | 68.651 |
| 2998.76434 | 68.392 |
| 2999.57807 | 67.898 |
| 3000.66299 | 68.654 |
| 3001.74785 | 69.194 |
| 3002.56145 | 69.255 |
| 3003.64621 | 69.601 |
| 3004.73091 | 69.474 |
| 3005.54439 | 69.133 |
| 3006.62899 | 69.697 |
| 3007.71352 | 70.131 |
| 3008.798 | 69.673 |
| 3009.61132 | 69.95 |
| 3010.6957 | 69.568 |
| 3011.78001 | 69.888 |
| 3012.59321 | 70.319 |
| 3013.67743 | 69.924 |
| 3014.76158 | 70.339 |
| 3015.57466 | 70.513 |
| 3016.65871 | 70.654 |
| 3017.74271 | 70.413 |
| 3018.55566 | 70.56 |
| 3019.63955 | 70.613 |
| 3020.72339 | 70.716 |
| 3021.53622 | 70.687 |
| 3022.61995 | 70.664 |
| 3023.70362 | 70.699 |
| 3024.78723 | 71.457 |
| 3025.5999 | 71.399 |
| 3026.68341 | 71.239 |
| 3027.76686 | 71.042 |
| 3028.5794 | 71.677 |
| 3029.66275 | 71.791 |
| 3030.74603 | 71.838 |
| 3031.55846 | 71.758 |
| 3032.64164 | 71.632 |
| 3033.72477 | 72.293 |
| 3034.53707 | 71.718 |
| 3035.62009 | 71.949 |
| 3036.70305 | 72.511 |
| 3037.78595 | 72.779 |
| 3038.59809 | 72.832 |
| 3039.68089 | 72.973 |
| 3040.76363 | 73.701 |
| 3041.57564 | 73.044 |
| 3042.65828 | 72.891 |
| 3043.74085 | 72.801 |
| 3044.55275 | 73.172 |
| 3045.63522 | 73.007 |
| 3046.71763 | 73.268 |
| 3047.5294 | 73.303 |
| 3048.61171 | 73.486 |
| 3049.69396 | 74.252 |
| 3050.77615 | 74.129 |
| 3051.58775 | 73.835 |
| 3052.66984 | 74.021 |
| 3053.75186 | 74.94 |
| 3054.56334 | 74.113 |
| 3055.64527 | 74.752 |
| 3056.72713 | 73.785 |
| 3057.53849 | 74.867 |
| 3058.62024 | 74.812 |
| 3059.70194 | 74.937 |
| 3060.51318 | 74.79 |
| 3061.59477 | 74.845 |
| 3062.6763 | 74.867 |
| 3063.75778 | 75.16 |
| 3064.56885 | 75.199 |
| 3065.65022 | 75.315 |
| 3066.73153 | 74.981 |
| 3067.54247 | 75.95 |
| 3068.62368 | 75.086 |
| 3069.70482 | 75.191 |
| 3070.51564 | 75.25 |
| 3071.59668 | 74.619 |
| 3072.67766 | 75.549 |
| 3073.75858 | 75.193 |
| 3074.56924 | 75.127 |
| 3075.65005 | 75.138 |
| 3076.73081 | 75.716 |
| 3077.54134 | 76.025 |
| 3078.62199 | 75.897 |
| 3079.70258 | 75.805 |
| 3080.51298 | 76.107 |
| 3081.59347 | 75.951 |
| 3082.6739 | 75.519 |
| 3083.75426 | 75.999 |
| 3084.5645 | 76.197 |
| 3085.64476 | 75.975 |
| 3086.72496 | 75.995 |
| 3087.53507 | 76.015 |
| 3088.61517 | 75.603 |
| 3089.6952 | 76.455 |
| 3090.50519 | 76.058 |
| 3091.58512 | 76.3 |
| 3092.66499 | 76.38 |
| 3093.7448 | 76.577 |
| 3094.55461 | 76.639 |
| 3095.63432 | 76.39 |
| 3096.71396 | 76.615 |
| 3097.52365 | 76.658 |
| 3098.60319 | 76.329 |
| 3099.68267 | 76.19 |
| 3100.76209 | 76.554 |
| 3101.57161 | 77.225 |
| 3102.65092 | 76.776 |
| 3103.73017 | 76.827 |
| 3104.53957 | 77.319 |
| 3105.61871 | 76.931 |
| 3106.6978 | 76.809 |
| 3107.50707 | 76.296 |
| 3108.58605 | 76.941 |
| 3109.66497 | 77.268 |
| 3110.74382 | 77.284 |
| 3111.55293 | 76.94 |
| 3112.63168 | 77.155 |
| 3113.71037 | 77.166 |
| 3114.51934 | 77.273 |
| 3115.59793 | 77.953 |
| 3116.67645 | 77.188 |
| 3117.75491 | 77.214 |
| 3118.56372 | 76.995 |
| 3119.64208 | 78.109 |
| 3120.72037 | 76.839 |
| 3121.52905 | 77.419 |
| 3122.60724 | 77.406 |
| 3123.68537 | 77.084 |
| 3124.49392 | 76.853 |
| 3125.57195 | 77.357 |
| 3126.64991 | 77.39 |
| 3127.7278 | 77.342 |
| 3128.53619 | 77.619 |
| 3129.61398 | 77.173 |
| 3130.69171 | 76.988 |
| 3131.49997 | 77.792 |
| 3132.5776 | 77.618 |
| 3133.65516 | 77.848 |
| 3134.73266 | 77.558 |
| 3135.54075 | 77.75 |
| 3136.61814 | 77.634 |
| 3137.69548 | 78.34 |
| 3138.50344 | 77.93 |
| 3139.58067 | 77.903 |
| 3140.65783 | 77.917 |
| 3141.73494 | 78.68 |
| 3142.54273 | 78.094 |
| 3143.61972 | 77.59 |
| 3144.69666 | 77.195 |
| 3145.50432 | 78.758 |
| 3146.58115 | 77.973 |
| 3147.65792 | 78.66 |
| 3148.73463 | 77.868 |
| 3149.54212 | 78.422 |
| 3150.61871 | 78.005 |
| 3151.69525 | 78.623 |
| 3152.50261 | 77.904 |
| 3153.57904 | 77.613 |
| 3154.65541 | 78.501 |
| 3155.73172 | 78.124 |
| 3156.53891 | 78.373 |
| 3157.61511 | 78.945 |
| 3158.69125 | 78.606 |
| 3159.49831 | 78.529 |
| 3160.57434 | 78.539 |
| 3161.65031 | 78.537 |
| 3162.72622 | 78.044 |
| 3163.5331 | 78.043 |
| 3164.6089 | 78.429 |
| 3165.68464 | 78.421 |
| 3166.4914 | 78.548 |
| 3167.56703 | 78.733 |
| 3168.6426 | 78.949 |
| 3169.71811 | 78.612 |
| 3170.52469 | 78.751 |
| 3171.60009 | 78.927 |
| 3172.67543 | 78.697 |
| 3173.48189 | 79.545 |
| 3174.55712 | 79.089 |
| 3175.63228 | 78.946 |
| 3176.70738 | 78.568 |
| 3177.51367 | 79.049 |
| 3178.58867 | 78.926 |
| 3179.6636 | 78.729 |
| 3180.73847 | 79.403 |
| 3181.54458 | 79.517 |
| 3182.61935 | 79.189 |
| 3183.69405 | 79.246 |
| 3184.50003 | 79.305 |
| 3185.57462 | 79.175 |
| 3186.64915 | 79.393 |
| 3187.72362 | 79.548 |
| 3188.52943 | 79.623 |
| 3189.60379 | 79.309 |
| 3190.67809 | 79.8 |
| 3191.48377 | 78.884 |
| 3192.55796 | 79.687 |
| 3193.63208 | 79.518 |
| 3194.70615 | 79.673 |
| 3195.51165 | 79.469 |
| 3196.58561 | 80.24 |
| 3197.6595 | 79.568 |
| 3198.73333 | 80.049 |
| 3199.53866 | 79.656 |
| 3200.61238 | 80.1 |
| 3201.68604 | 79.541 |
| 3202.49124 | 80.18 |
| 3203.56479 | 79.836 |
| 3204.63828 | 79.755 |
| 3205.7117 | 79.9 |
| 3206.51673 | 80.077 |
| 3207.59004 | 80.037 |
| 3208.66329 | 80.337 |
| 3209.46819 | 80.564 |
| 3210.54134 | 80.017 |
| 3211.61442 | 80.041 |
| 3212.68743 | 80.104 |
| 3213.49215 | 80.098 |
| 3214.56506 | 80.82 |
| 3215.63791 | 80.551 |
| 3216.71069 | 79.93 |
| 3217.51524 | 80.604 |
| 3218.58791 | 80.59 |
| 3219.66052 | 80.861 |
| 3220.46493 | 80.602 |
| 3221.53743 | 80.423 |
| 3222.60987 | 80.847 |
| 3223.68225 | 81.037 |
| 3224.48649 | 80.585 |
| 3225.55875 | 81.128 |
| 3226.63095 | 80.359 |
| 3227.70309 | 80.531 |
| 3228.50715 | 81.124 |
| 3229.57918 | 81.417 |
| 3230.65115 | 80.838 |
| 3231.72305 | 80.781 |
| 3232.52694 | 80.979 |
| 3233.59873 | 81.141 |
| 3234.67046 | 81.41 |
| 3235.47421 | 80.527 |
| 3236.54583 | 80.662 |
| 3237.61739 | 81.215 |
| 3238.68888 | 81.124 |
| 3239.49246 | 81.01 |
| 3240.56384 | 81.118 |
| 3241.63516 | 80.892 |
| 3242.70642 | 80.852 |
| 3243.50982 | 81.837 |
| 3244.58096 | 81.022 |
| 3245.65204 | 80.659 |
| 3246.45531 | 80.3 |
| 3247.52628 | 81.027 |
| 3248.59719 | 81.218 |
| 3249.66804 | 81.239 |
| 3250.47113 | 81.082 |
| 3251.54186 | 81.423 |
| 3252.61253 | 81.201 |
| 3253.68314 | 81.324 |
| 3254.48605 | 81.447 |
| 3255.55655 | 81.143 |
| 3256.62698 | 81.278 |
| 3257.69735 | 80.963 |
| 3258.50008 | 80.489 |
| 3259.57034 | 81.735 |
| 3260.64054 | 81.319 |
| 3261.71067 | 81.15 |
| 3262.51322 | 81.163 |
| 3263.58324 | 80.626 |
| 3264.6532 | 81.344 |
| 3265.45562 | 81.57 |
| 3266.52547 | 81.478 |
| 3267.59525 | 81.549 |
| 3268.66496 | 81.413 |
| 3269.46721 | 80.303 |
| 3270.53682 | 81.238 |
| 3271.60636 | 81.459 |
| 3272.67583 | 82.003 |
| 3273.4779 | 81.202 |
| 3274.54727 | 81.566 |
| 3275.61657 | 81.918 |
| 3276.68581 | 81.872 |
| 3277.4877 | 82.107 |
| 3278.55682 | 82.011 |
| 3279.62588 | 81.704 |
| 3280.69488 | 81.632 |
| 3281.49659 | 81.408 |
| 3282.56548 | 82.411 |
| 3283.6343 | 81.657 |
| 3284.70306 | 81.312 |
| 3285.50459 | 81.8 |
| 3286.57323 | 81.733 |
| 3287.64182 | 81.905 |
| 3288.44321 | 81.115 |
| 3289.51168 | 81.789 |
| 3290.58009 | 82.222 |
| 3291.64843 | 81.853 |
| 3292.44964 | 82.176 |
| 3293.51787 | 81.955 |
| 3294.58604 | 82.527 |
| 3295.65414 | 81.66 |
| 3296.45517 | 81.555 |
| 3297.52316 | 81.484 |
| 3298.59109 | 81.913 |
| 3299.65895 | 81.676 |
| 3300.4598 | 81.764 |
| 3301.52755 | 82.327 |
| 3302.59523 | 81.979 |
| 3303.66285 | 81.876 |
| 3304.46352 | 81.858 |
| 3305.53103 | 81.388 |
| 3306.59847 | 80.908 |
| 3307.66585 | 82.326 |
| 3308.46634 | 81.86 |
| 3309.53361 | 82.015 |
| 3310.60081 | 82.338 |
| 3311.66794 | 82.371 |
| 3312.46825 | 81.712 |
| 3313.53527 | 81.753 |
| 3314.60223 | 82.005 |
| 3315.66912 | 81.652 |
| 3316.46925 | 82.248 |
| 3317.53603 | 82.575 |
| 3318.60275 | 82.455 |
| 3319.6694 | 81.995 |
| 3320.46934 | 82.746 |
| 3321.53588 | 82.296 |
| 3322.60235 | 82.054 |
| 3323.66876 | 82.57 |
| 3324.46853 | 82.147 |
| 3325.53482 | 82.227 |
| 3326.60105 | 81.841 |
| 3327.66721 | 81.374 |
| 3328.4668 | 82.568 |
| 3329.53285 | 81.321 |
| 3330.59883 | 81.666 |
| 3331.66475 | 82.623 |
| 3332.46415 | 82.574 |
| 3333.52996 | 82.232 |
| 3334.5957 | 82.544 |
| 3335.66138 | 82.055 |
| 3336.4606 | 81.976 |
| 3337.52616 | 82.337 |
| 3338.59166 | 82.644 |
| 3339.65709 | 82.318 |
| 3340.45613 | 81.727 |
| 3341.52145 | 81.983 |
| 3342.5867 | 81.921 |
| 3343.65189 | 81.344 |
| 3344.45074 | 81.829 |
| 3345.51582 | 81.467 |
| 3346.58083 | 81.081 |
| 3347.64577 | 81.724 |
| 3348.44444 | 81.595 |
| 3349.50927 | 81.34 |
| 3350.57403 | 81.296 |
| 3351.63873 | 80.886 |
| 3352.43722 | 81.588 |
| 3353.5018 | 80.605 |
| 3354.56632 | 81.231 |
| 3355.63078 | 80.645 |
| 3356.42908 | 81.858 |
| 3357.49342 | 81.488 |
| 3358.55769 | 81.309 |
| 3359.6219 | 80.802 |
| 3360.42002 | 81.346 |
| 3361.48411 | 80.987 |
| 3362.54814 | 80.769 |
| 3363.6121 | 81.442 |
| 3364.676 | 81.012 |
| 3365.47388 | 81.347 |
| 3366.53767 | 81.305 |
| 3367.60138 | 80.804 |
| 3368.66504 | 80.978 |
| 3369.46273 | 81.624 |
| 3370.52627 | 81.285 |
| 3371.58974 | 81.239 |
| 3372.65315 | 79.48 |
| 3373.45066 | 81.147 |
| 3374.51395 | 81.311 |
| 3375.57717 | 80.297 |
| 3376.64033 | 80.922 |
| 3377.43766 | 80.543 |
| 3378.5007 | 80.755 |
| 3379.56368 | 80.608 |
| 3380.62659 | 80.929 |
| 3381.42373 | 80.43 |
| 3382.48653 | 81.094 |
| 3383.54926 | 80.405 |
| 3384.61193 | 79.657 |
| 3385.40888 | 80.53 |
| 3386.47143 | 79.32 |
| 3387.53392 | 80.519 |
| 3388.59633 | 80.949 |
| 3389.65868 | 80.288 |
| 3390.4554 | 80.341 |
| 3391.51764 | 80.2 |
| 3392.57981 | 80.101 |
| 3393.64191 | 80.104 |
| 3394.43845 | 79.749 |
| 3395.50043 | 80.392 |
| 3396.56236 | 79.753 |
| 3397.62421 | 79.804 |
| 3398.42056 | 79.777 |
| 3399.4823 | 79.961 |
| 3400.54397 | 79.815 |
| 3401.60558 | 79.249 |
| 3402.40174 | 79.294 |
| 3403.46323 | 79.337 |
| 3404.52465 | 78.842 |
| 3405.58601 | 78.669 |
| 3406.6473 | 78.904 |
| 3407.44323 | 79.022 |
| 3408.5044 | 78.522 |
| 3409.56551 | 78.355 |
| 3410.62656 | 79.052 |
| 3411.42229 | 79.082 |
| 3412.48322 | 78.258 |
| 3413.54408 | 78.871 |
| 3414.60487 | 77.758 |
| 3415.40042 | 78.361 |
| 3416.4611 | 78.17 |
| 3417.52171 | 79.186 |
| 3418.58225 | 78.61 |
| 3419.64273 | 78.805 |
| 3420.43804 | 78.257 |
| 3421.4984 | 77.376 |
| 3422.5587 | 78.405 |
| 3423.61892 | 77.361 |
| 3424.41405 | 77.371 |
| 3425.47416 | 77.338 |
| 3426.5342 | 77.273 |
| 3427.59418 | 76.939 |
| 3428.65409 | 77.126 |
| 3429.44897 | 77.403 |
| 3430.50877 | 77.047 |
| 3431.56849 | 76 |
| 3432.62815 | 76.714 |
| 3433.42285 | 76.419 |
| 3434.48239 | 76.169 |
| 3435.54186 | 76.273 |
| 3436.60127 | 76.819 |
| 3437.39578 | 76.154 |
| 3438.45507 | 75.532 |
| 3439.5143 | 75.774 |
| 3440.57345 | 75.88 |
| 3441.63254 | 76.072 |
| 3442.42681 | 74.983 |
| 3443.48579 | 75.128 |
| 3444.54469 | 74.804 |
| 3445.60353 | 74.701 |
| 3446.39761 | 75.407 |
| 3447.45633 | 74.966 |
| 3448.51498 | 75.272 |
| 3449.57357 | 74.82 |
| 3450.63209 | 74.192 |
| 3451.42593 | 73.96 |
| 3452.48433 | 74.167 |
| 3453.54266 | 74.924 |
| 3454.60093 | 74.425 |
| 3455.39458 | 73.553 |
| 3456.45273 | 74.176 |
| 3457.51081 | 72.927 |
| 3458.56883 | 73.42 |
| 3459.62677 | 73.328 |
| 3460.42019 | 72.846 |
| 3461.47801 | 72.812 |
| 3462.53577 | 72.43 |
| 3463.59347 | 73.08 |
| 3464.38669 | 72.13 |
| 3465.44426 | 71.946 |
| 3466.50177 | 72.099 |
| 3467.55921 | 71.992 |
| 3468.61658 | 71.339 |
| 3469.40957 | 71.804 |
| 3470.46682 | 70.793 |
| 3471.524 | 71.677 |
| 3472.58112 | 70.883 |
| 3473.63817 | 70.075 |
| 3474.43092 | 71.01 |
| 3475.48785 | 70.547 |
| 3476.54471 | 69.579 |
| 3477.60151 | 69.924 |
| 3478.39406 | 69.659 |
| 3479.45074 | 69.944 |
| 3480.50735 | 69.689 |
| 3481.56389 | 69.056 |
| 3482.62036 | 68.661 |
| 3483.41267 | 67.855 |
| 3484.46903 | 67.964 |
| 3485.52532 | 68.221 |
| 3486.58153 | 67.944 |
| 3487.37365 | 68.209 |
| 3488.42975 | 67.592 |
| 3489.48579 | 66.808 |
| 3490.54175 | 66.357 |
| 3491.59765 | 66.847 |
| 3492.38952 | 66.155 |
| 3493.4453 | 65.979 |
| 3494.50101 | 65.606 |
| 3495.55665 | 65.274 |
| 3496.61222 | 65.115 |
| 3497.40386 | 65.705 |
| 3498.45931 | 65.612 |
| 3499.5147 | 64.942 |
| 3500.57001 | 64.722 |
| 3501.62526 | 64.246 |
| 3502.41665 | 63.835 |
| 3503.47178 | 64.247 |
| 3504.52684 | 63.29 |
| 3505.58184 | 62.839 |
| 3506.37304 | 62.838 |
| 3507.42791 | 63.086 |
| 3508.48271 | 63.1 |
| 3509.53745 | 63.037 |
| 3510.59212 | 62.14 |
| 3511.38307 | 62.508 |
| 3512.43762 | 61.159 |
| 3513.4921 | 62.041 |
| 3514.54651 | 61.243 |
| 3515.60085 | 60.65 |
| 3516.39156 | 61.387 |
| 3517.44579 | 60.024 |
| 3518.49994 | 60.488 |
| 3519.55403 | 60.244 |
| 3520.60804 | 59.15 |
| 3521.39851 | 59.794 |
| 3522.45241 | 58.704 |
| 3523.50623 | 58.888 |
| 3524.55999 | 59.59 |
| 3525.61368 | 58.011 |
| 3526.40391 | 57.817 |
| 3527.45748 | 57.889 |
| 3528.51098 | 57.727 |
| 3529.56441 | 58.163 |
| 3530.61777 | 57.962 |
| 3531.40775 | 57.311 |
| 3532.461 | 57.409 |
| 3533.51417 | 56.446 |
| 3534.56728 | 56.463 |
| 3535.35706 | 56.319 |
| 3536.41004 | 56.238 |
| 3537.46296 | 55.88 |
| 3538.51581 | 55.02 |
| 3539.56859 | 55.611 |
| 3540.35812 | 54.551 |
| 3541.41078 | 55.214 |
| 3542.46337 | 54.014 |
| 3543.51589 | 54.274 |
| 3544.56834 | 54.098 |
| 3545.35763 | 54.509 |
| 3546.40996 | 53.523 |
| 3547.46222 | 52.878 |
| 3548.51441 | 52.875 |
| 3549.56653 | 52.751 |
| 3550.35558 | 52.356 |
| 3551.40758 | 52.99 |
| 3552.45951 | 51.844 |
| 3553.51137 | 52.333 |
| 3554.56316 | 52.181 |
| 3555.35196 | 51.958 |
| 3556.40364 | 51.44 |
| 3557.45524 | 51.109 |
| 3558.50677 | 51.28 |
| 3559.55823 | 50.97 |
| 3560.60963 | 50.003 |
| 3561.39813 | 50.093 |
| 3562.4494 | 50.18 |
| 3563.5006 | 49.624 |
| 3564.55174 | 49.947 |
| 3565.6028 | 50.04 |
| 3566.39105 | 49.402 |
| 3567.442 | 49.951 |
| 3568.49287 | 49.765 |
| 3569.54367 | 49.07 |
| 3570.59441 | 48.937 |
| 3571.38241 | 48.481 |
| 3572.43302 | 49.204 |
| 3573.48357 | 48.335 |
| 3574.53404 | 48.648 |
| 3575.58444 | 47.529 |
| 3576.3722 | 47.715 |
| 3577.42248 | 48.454 |
| 3578.47269 | 47.686 |
| 3579.52283 | 46.675 |
| 3580.5729 | 47.139 |
| 3581.36041 | 46.868 |
| 3582.41036 | 47.229 |
| 3583.46024 | 46.678 |
| 3584.51005 | 46.616 |
| 3585.55979 | 45.788 |
| 3586.34705 | 46.82 |
| 3587.39667 | 46.376 |
| 3588.44621 | 45.949 |
| 3589.49569 | 46.304 |
| 3590.5451 | 45.649 |
| 3591.59444 | 45.702 |
| 3592.38139 | 45.413 |
| 3593.43061 | 45.53 |
| 3594.47975 | 45.449 |
| 3595.52883 | 45.221 |
| 3596.57783 | 44.486 |
| 3597.36454 | 45.284 |
| 3598.41342 | 44.518 |
| 3599.46224 | 43.701 |
| 3600.51098 | 43.7 |
| 3601.55965 | 44.2 |
| 3602.34611 | 43.137 |
| 3603.39466 | 44.605 |
| 3604.44313 | 43.206 |
| 3605.49154 | 43.69 |
| 3606.53988 | 43.656 |
| 3607.58815 | 44.602 |
| 3608.3743 | 43.553 |
| 3609.42245 | 43.639 |
| 3610.47052 | 42.747 |
| 3611.51852 | 42.601 |
| 3612.56646 | 42.725 |
| 3613.35236 | 42.647 |
| 3614.40017 | 42.597 |
| 3615.44791 | 42.002 |
| 3616.49558 | 42.395 |
| 3617.54318 | 42.447 |
| 3618.59071 | 41.63 |
| 3619.37631 | 41.868 |
| 3620.42371 | 41.778 |
| 3621.47105 | 41.9 |
| 3622.51831 | 40.555 |
| 3623.5655 | 41.652 |
| 3624.35085 | 40.911 |
| 3625.39792 | 40.081 |
| 3626.44492 | 39.628 |
| 3627.49185 | 40.687 |
| 3628.5387 | 39.763 |
| 3629.58549 | 39.791 |
| 3630.37053 | 39.824 |
| 3631.4172 | 39.815 |
| 3632.46379 | 38.639 |
| 3633.51031 | 39.165 |
| 3634.55676 | 38.787 |
| 3635.34155 | 38.088 |
| 3636.38788 | 38.276 |
| 3637.43413 | 36.803 |
| 3638.48031 | 37.403 |
| 3639.52643 | 38.021 |
| 3640.57247 | 37.259 |
| 3641.35696 | 36.78 |
| 3642.40287 | 37.011 |
| 3643.44872 | 36.456 |
| 3644.4945 | 36.936 |
| 3645.5402 | 35.554 |
| 3646.32443 | 35.989 |
| 3647.37002 | 35.912 |
| 3648.41552 | 34.969 |
| 3649.46096 | 35.711 |
| 3650.50633 | 34.953 |
| 3651.55163 | 35.425 |
| 3652.33555 | 34.463 |
| 3653.38072 | 33.686 |
| 3654.42582 | 33.569 |
| 3655.47085 | 35.053 |
| 3656.51581 | 33.92 |
| 3657.5607 | 33.85 |
| 3658.34432 | 32.902 |
| 3659.38908 | 32.507 |
| 3660.43377 | 32.575 |
| 3661.47839 | 32.133 |
| 3662.52293 | 31.991 |
| 3663.56741 | 31.761 |
| 3664.35072 | 31.909 |
| 3665.39507 | 30.888 |
| 3666.43935 | 31.413 |
| 3667.48356 | 30.885 |
| 3668.5277 | 30.49 |
| 3669.57176 | 30.564 |
| 3670.35476 | 29.872 |
| 3671.3987 | 28.769 |
| 3672.44257 | 30.333 |
| 3673.48637 | 29.585 |
| 3674.53009 | 27.982 |
| 3675.31284 | 28.712 |
| 3676.35644 | 27.997 |
| 3677.39997 | 27.921 |
| 3678.44343 | 27.701 |
| 3679.48681 | 27.598 |
| 3680.53012 | 27.699 |
| 3681.31256 | 27.592 |
| 3682.35575 | 26.825 |
| 3683.39886 | 26.93 |
| 3684.44191 | 26.517 |
| 3685.48488 | 25.478 |
| 3686.52778 | 26.708 |
| 3687.30991 | 26.834 |
| 3688.35268 | 25.407 |
| 3689.39539 | 24.929 |
| 3690.43802 | 25.572 |
| 3691.48057 | 24.446 |
| 3692.52306 | 25.023 |
| 3693.56548 | 25.034 |
| 3694.34724 | 24.352 |
| 3695.38953 | 23.715 |
| 3696.43175 | 24.839 |
| 3697.47389 | 23.882 |
| 3698.51596 | 23.698 |
| 3699.55796 | 23.325 |
| 3700.33942 | 22.88 |
| 3701.38129 | 24.001 |
| 3702.42309 | 22.511 |
| 3703.46482 | 22.191 |
| 3704.50648 | 21.602 |
| 3705.54806 | 22.765 |
| 3706.32921 | 21.831 |
| 3707.37066 | 22.989 |
| 3708.41205 | 21.731 |
| 3709.45337 | 21.754 |
| 3710.49461 | 21.452 |
| 3711.53578 | 21.488 |
| 3712.31661 | 20.554 |
| 3713.35765 | 20.971 |
| 3714.39862 | 21.076 |
| 3715.43952 | 20.487 |
| 3716.48035 | 20.072 |
| 3717.5211 | 19.616 |
| 3718.30162 | 21.586 |
| 3719.34224 | 20.185 |
| 3720.3828 | 19.995 |
| 3721.42328 | 19.119 |
| 3722.46369 | 19.418 |
| 3723.50402 | 19.923 |
| 3724.54429 | 19.092 |
| 3725.32444 | 19.013 |
| 3726.36457 | 17.983 |
| 3727.40464 | 18.574 |
| 3728.44463 | 18.775 |
| 3729.48455 | 18.78 |
| 3730.52439 | 19.234 |
| 3731.30423 | 18.602 |
| 3732.34395 | 18.671 |
| 3733.3836 | 19.026 |
| 3734.42317 | 18.973 |
| 3735.46267 | 18.668 |
| 3736.5021 | 18.945 |
| 3737.54145 | 17.703 |
| 3738.32092 | 18.018 |
| 3739.36015 | 17.907 |
| 3740.3993 | 16.986 |
| 3741.43838 | 17.762 |
| 3742.47739 | 18.752 |
| 3743.51633 | 17.952 |
| 3744.29548 | 17.773 |
| 3745.33429 | 18.321 |
| 3746.37302 | 18.218 |
| 3747.41168 | 17.951 |
| 3748.45027 | 17.12 |
| 3749.48879 | 17.241 |
| 3750.52723 | 17.274 |
| 3751.30601 | 17.712 |
| 3752.34433 | 17.106 |
| 3753.38257 | 17.117 |
| 3754.42074 | 16.278 |
| 3755.45883 | 16.38 |
| 3756.49685 | 16.744 |
| 3757.5348 | 16.731 |
| 3758.31322 | 16.768 |
| 3759.35104 | 16.209 |
| 3760.38878 | 16.434 |
| 3761.42646 | 17.407 |
| 3762.46406 | 17.82 |
| 3763.50158 | 17.166 |
| 3764.53904 | 17.583 |
| 3765.31708 | 17.851 |
| 3766.3544 | 16.575 |
| 3767.39166 | 16.868 |
| 3768.42883 | 17.297 |
| 3769.46594 | 16.288 |
| 3770.50297 | 16.913 |
| 3771.2807 | 16.438 |
| 3772.3176 | 17.146 |
| 3773.35443 | 16.769 |
| 3774.39118 | 16.899 |
| 3775.42786 | 16.484 |
| 3776.46447 | 17.34 |
| 3777.50101 | 15.877 |
| 3778.27836 | 15.94 |
| 3779.31477 | 17.235 |
| 3780.3511 | 17.451 |
| 3781.38736 | 16.619 |
| 3782.42354 | 16.634 |
| 3783.45965 | 16.532 |
| 3784.49569 | 17.735 |
| 3785.53165 | 17.238 |
| 3786.30858 | 17.35 |
| 3787.34441 | 17.069 |
| 3788.38017 | 17.104 |
| 3789.41586 | 17.591 |
| 3790.45147 | 17.814 |
| 3791.48701 | 16.846 |
| 3792.52248 | 17.373 |
| 3793.29903 | 17.217 |
| 3794.33436 | 17.795 |
| 3795.36962 | 18.114 |
| 3796.40481 | 16.86 |
| 3797.43992 | 17.721 |
| 3798.47496 | 17.519 |
| 3799.50993 | 17.214 |
| 3800.2861 | 17.92 |
| 3801.32094 | 18.326 |
| 3802.3557 | 17.482 |
| 3803.39039 | 17.655 |
| 3804.425 | 17.602 |
| 3805.45954 | 16.582 |
| 3806.49401 | 17.431 |
| 3807.26981 | 16.638 |
| 3808.30414 | 17.364 |
| 3809.3384 | 17.418 |
| 3810.37259 | 17.937 |
| 3811.4067 | 17.178 |
| 3812.44074 | 16.483 |
| 3813.4747 | 17.027 |
| 3814.50859 | 17.653 |
| 3815.28396 | 17.103 |
| 3816.31772 | 17.709 |
| 3817.35141 | 17.894 |
| 3818.38502 | 18.011 |
| 3819.41855 | 17.764 |
| 3820.45201 | 17.825 |
| 3821.4854 | 18.098 |
| 3822.51871 | 17.224 |
| 3823.29365 | 16.636 |
| 3824.32683 | 17.483 |
| 3825.35994 | 17.582 |
| 3826.39297 | 17.844 |
| 3827.42593 | 18.372 |
| 3828.45881 | 17.886 |
| 3829.49162 | 18.084 |
| 3830.26618 | 17.625 |
| 3831.29886 | 17.608 |
| 3832.33146 | 17.635 |
| 3833.36399 | 17.611 |
| 3834.39645 | 18.427 |
| 3835.42883 | 17.289 |
| 3836.46113 | 17.081 |
| 3837.49336 | 17.116 |
| 3838.26748 | 17.763 |
| 3839.29958 | 18.113 |
| 3840.33161 | 17.939 |
| 3841.36356 | 18.041 |
| 3842.39543 | 17.497 |
| 3843.42723 | 17.367 |
| 3844.45896 | 18.381 |
| 3845.4906 | 18.145 |
| 3846.26429 | 18.321 |
| 3847.29581 | 17.613 |
| 3848.32725 | 17.312 |
| 3849.35862 | 17.276 |
| 3850.38992 | 17.53 |
| 3851.42113 | 18.613 |
| 3852.45228 | 17.216 |
| 3853.48335 | 18.379 |
| 3854.2566 | 17.032 |
| 3855.28753 | 17.198 |
| 3856.3184 | 18.688 |
| 3857.34918 | 17.557 |
| 3858.37989 | 17.559 |
| 3859.41053 | 17.694 |
| 3860.44109 | 18.254 |
| 3861.47158 | 18.383 |
| 3862.50199 | 16.906 |
| 3863.27474 | 17.127 |
| 3864.30502 | 17.886 |
| 3865.33522 | 16.923 |
| 3866.36535 | 17.998 |
| 3867.3954 | 17.368 |
| 3868.42538 | 17.23 |
| 3869.45528 | 17.217 |
| 3870.48511 | 17.585 |
| 3871.25743 | 17.091 |
| 3872.28712 | 17.097 |
| 3873.31674 | 17.829 |
| 3874.34628 | 17.927 |
| 3875.37575 | 17.199 |
| 3876.40514 | 16.425 |
| 3877.43446 | 17.203 |
| 3878.4637 | 17.769 |
| 3879.49287 | 16.542 |
| 3880.26469 | 17.107 |
| 3881.29372 | 16.171 |
| 3882.32268 | 17.076 |
| 3883.35156 | 18.581 |
| 3884.38037 | 18.158 |
| 3885.4091 | 18.137 |
| 3886.43775 | 17.043 |
| 3887.46633 | 17.67 |
| 3888.49483 | 16.138 |
| 3889.26616 | 16.47 |
| 3890.29453 | 16.946 |
| 3891.32282 | 16.846 |
| 3892.35104 | 16.575 |
| 3893.37918 | 17.585 |
| 3894.40725 | 16.061 |
| 3895.43524 | 17.513 |
| 3896.46315 | 18.289 |
| 3897.49099 | 17.744 |
| 3898.26182 | 17.626 |
| 3899.28953 | 17.089 |
| 3900.31716 | 16.597 |
| 3901.34471 | 16.598 |
| 3902.37219 | 17.202 |
| 3903.39959 | 16.578 |
| 3904.42691 | 16.678 |
| 3905.45416 | 16.25 |
| 3906.48134 | 16.661 |
| 3907.25167 | 16.753 |
| 3908.27871 | 16.156 |
| 3909.30567 | 17.572 |
| 3910.33256 | 17.191 |
| 3911.35937 | 17.404 |
| 3912.3861 | 16.468 |
| 3913.41276 | 15.418 |
| 3914.43934 | 15.899 |
| 3915.46585 | 15.445 |
| 3916.23568 | 15.88 |
| 3917.26205 | 17.268 |
| 3918.28835 | 16.747 |
| 3919.31457 | 16.808 |
| 3920.34071 | 16.749 |
| 3921.36678 | 16.862 |
| 3922.39277 | 16.834 |
| 3923.41868 | 16.569 |
| 3924.44452 | 16.84 |
| 3925.47028 | 16.599 |
| 3926.23955 | 16.232 |
| 3927.26518 | 15.291 |
| 3928.29073 | 16.324 |
| 3929.3162 | 16.569 |
| 3930.3416 | 16.82 |
| 3931.36692 | 16.11 |
| 3932.39216 | 15.606 |
| 3933.41733 | 15.834 |
| 3934.44242 | 15.696 |
| 3935.46744 | 15.617 |
| 3936.23615 | 14.992 |
| 3937.26102 | 15.554 |
| 3938.28583 | 16.47 |
| 3939.31055 | 15.134 |
| 3940.3352 | 17.162 |
| 3941.35978 | 16.078 |
| 3942.38427 | 16.45 |
| 3943.40869 | 16.048 |
| 3944.43303 | 15.336 |
| 3945.4573 | 15.257 |
| 3946.22544 | 15.246 |
| 3947.24957 | 15.833 |
| 3948.27363 | 15.826 |
| 3949.2976 | 15.188 |
| 3950.3215 | 15.743 |
| 3951.34533 | 15.692 |
| 3952.36907 | 16.259 |
| 3953.39274 | 14.541 |
| 3954.41633 | 15.344 |
| 3955.43985 | 15.891 |
| 3956.46328 | 14.871 |
| 3957.23081 | 14.278 |
| 3958.25411 | 14.464 |
| 3959.27734 | 15.735 |
| 3960.30048 | 14.998 |
| 3961.32355 | 15.429 |
| 3962.34655 | 15.724 |
| 3963.36946 | 14.628 |
| 3964.3923 | 14.731 |
| 3965.41506 | 16.195 |
| 3966.43775 | 14.161 |
| 3967.46036 | 15.147 |
| 3968.22726 | 14.806 |
| 3969.24973 | 15.172 |
| 3970.27212 | 14.179 |
| 3971.29444 | 14.018 |
| 3972.31668 | 14.178 |
| 3973.33884 | 13.891 |
| 3974.36093 | 14.668 |
| 3975.38293 | 14.463 |
| 3976.40486 | 14.352 |
| 3977.42671 | 13.678 |
| 3978.44849 | 13.909 |
| 3979.21477 | 13.752 |
| 3980.23641 | 14.871 |
| 3981.25797 | 14.852 |
| 3982.27945 | 14.515 |
| 3983.30086 | 13.984 |
| 3984.32219 | 14.069 |
| 3985.34344 | 15.29 |
| 3986.36461 | 14.707 |
| 3987.3857 | 13.816 |
| 3988.40672 | 14.134 |
| 3989.42766 | 14.051 |
| 3990.44852 | 13.378 |
| 3991.21412 | 12.787 |
| 3992.23484 | 13.199 |
| 3993.25549 | 12.997 |
| 3994.27606 | 13.603 |
| 3995.29655 | 13.438 |
| 3996.31697 | 14.269 |
| 3997.3373 | 13.108 |
| 3998.35756 | 11.805 |
| 3999.37774 | 13.005 |
| 4000.39784 | 13.094 |
| 4001.41787 | 13.59 |
| 4002.43781 | 12.351 |
| 4003.45768 | 11.98 |
| 4004.22253 | 11.752 |
| 4005.24226 | 11.824 |
| 4006.26192 | 13.378 |
| 4007.28149 | 12.241 |
| 4008.30099 | 10.732 |
| 4009.32041 | 11.58 |
| 4010.33975 | 11.895 |
| 4011.35901 | 12.557 |
| 4012.3782 | 11.803 |
| 4013.3973 | 10.916 |
| 4014.41633 | 12.383 |
| 4015.43528 | 11.548 |
| 4016.45415 | 12.463 |
| 4017.21826 | 11.789 |
| 4018.23699 | 11.894 |
| 4019.25565 | 11.296 |
| 4020.27422 | 10.716 |
| 4021.29272 | 12.636 |
| 4022.31115 | 11.296 |
| 4023.32949 | 11.048 |
| 4024.34775 | 10.865 |
| 4025.36594 | 10.641 |
| 4026.38405 | 10.911 |
| 4027.40207 | 10.123 |
| 4028.42002 | 10.007 |
| 4029.4379 | 10.346 |
| 4030.20125 | 11.203 |
| 4031.21898 | 10.311 |
| 4032.23664 | 10.831 |
| 4033.25422 | 11.205 |
| 4034.27171 | 10.057 |
| 4035.28913 | 9.992 |
| 4036.30648 | 10.068 |
| 4037.32374 | 10.042 |
| 4038.34092 | 9.269 |
| 4039.35803 | 9.994 |
| 4040.37505 | 10.568 |
| 4041.392 | 9.231 |
| 4042.40887 | 9.548 |
| 4043.42566 | 8.379 |
| 4044.44237 | 8.268 |
| 4045.20485 | 9.476 |
| 4046.22142 | 7.917 |
| 4047.23792 | 10.068 |
| 4048.25433 | 8.992 |
| 4049.27067 | 10.054 |
| 4050.28693 | 8.541 |
| 4051.30311 | 8.263 |
| 4052.31921 | 8.926 |
| 4053.33523 | 8.791 |
| 4054.35117 | 8.58 |
| 4055.36703 | 8.005 |
| 4056.38281 | 9.717 |
| 4057.39852 | 8.449 |
| 4058.41414 | 8.517 |
| 4059.42969 | 8.765 |
| 4060.1913 | 7.739 |
| 4061.2067 | 7.433 |
| 4062.22203 | 7.683 |
| 4063.23728 | 7.334 |
| 4064.25245 | 7.01 |
| 4065.26754 | 7.387 |
| 4066.28255 | 6.466 |
| 4067.29749 | 6.212 |
| 4068.31234 | 7.672 |
| 4069.32711 | 8.01 |
| 4070.34181 | 7.015 |
| 4071.35642 | 5.438 |
| 4072.37096 | 6.084 |
| 4073.38541 | 5.538 |
| 4074.39979 | 6.379 |
| 4075.41409 | 7.372 |
| 4076.42831 | 5.319 |
| 4077.18892 | 6.7 |
| 4078.203 | 6.565 |
| 4079.217 | 5.796 |
| 4080.23091 | 6.998 |
| 4081.24475 | 5.508 |
| 4082.25852 | 5.429 |
| 4083.2722 | 4.65 |
| 4084.2858 | 6.657 |
| 4085.29932 | 5.372 |
| 4086.31276 | 6.662 |
| 4087.32612 | 5.444 |
| 4088.33941 | 5.917 |
| 4089.35261 | 4.626 |
| 4090.36573 | 5.014 |
| 4091.37878 | 5.533 |
| 4092.39174 | 5.493 |
| 4093.40463 | 4.657 |
| 4094.41743 | 5.679 |
| 4095.17698 | 5.579 |
| 4096.18964 | 4.959 |
| 4097.20223 | 5.071 |
| 4098.21473 | 4.934 |
| 4099.22716 | 4.783 |
| 4100.2395 | 4.804 |
| 4101.25177 | 5.129 |
| 4102.26395 | 3.975 |
| 4103.27606 | 6.383 |
| 4104.28809 | 3.797 |
| 4105.30003 | 5.623 |
| 4106.3119 | 5.107 |
| 4107.32368 | 3.909 |
| 4108.33539 | 4.134 |
| 4109.34701 | 4.563 |
| 4110.35856 | 4.777 |
| 4111.37002 | 4.961 |
| 4112.3814 | 3.862 |
| 4113.39271 | 3.802 |
| 4114.40393 | 4.831 |
| 4115.41508 | 4.418 |
| 4116.17338 | 4.075 |
| 4117.18439 | 2.298 |
| 4118.19531 | 4.804 |
| 4119.20615 | 3.854 |
| 4120.21691 | 4.391 |
| 4121.2276 | 4.406 |
| 4122.2382 | 5.119 |
| 4123.24872 | 4.131 |
| 4124.25916 | 4.961 |
| 4125.26952 | 3.936 |
| 4126.2798 | 3.875 |
| 4127.29 | 3.542 |
| 4128.30012 | 4.203 |
| 4129.31016 | 4.289 |
| 4130.32012 | 4.658 |
| 4131.33 | 3.219 |
| 4132.33979 | 3.255 |
| 4133.34951 | 3.181 |
| 4134.35915 | 3.547 |
| 4135.3687 | 3.733 |
| 4136.37818 | 4.42 |
| 4137.38757 | 3.975 |
| 4138.39689 | 2.081 |
| 4139.40612 | 4.237 |
| 4140.16299 | 3.129 |
| 4141.17208 | 3.84 |
| 4142.18109 | 3.364 |
| 4143.19002 | 2.16 |
| 4144.19887 | 3.426 |
| 4145.20764 | 3.047 |
| 4146.21633 | 3.019 |
| 4147.22494 | 3.126 |
| 4148.23346 | 4.118 |
| 4149.24191 | 2.116 |
| 4150.25027 | 1.75 |
| 4151.25856 | 3.507 |
| 4152.26676 | 2.842 |
| 4153.27488 | 3.135 |
| 4154.28292 | 1.559 |
| 4155.29088 | 2.651 |
| 4156.29876 | 3.864 |
| 4157.30656 | 3.648 |
| 4158.31428 | 4.369 |
| 4159.32191 | 3.893 |
| 4160.32947 | 2.203 |
| 4161.33694 | 3.189 |
| 4162.34433 | 1.527 |
| 4163.35164 | 1.145 |
| 4164.35887 | 1.801 |
| 4165.36602 | 1.124 |
| 4166.37309 | 2.938 |
| 4167.38008 | 2.981 |
| 4168.38698 | 2.732 |
| 4169.39381 | 2.651 |
| 4170.40055 | 2.181 |
| 4171.15555 | 2.643 |
| 4172.16215 | 2.45 |
| 4173.16867 | 2.746 |
| 4174.17511 | 3.515 |
| 4175.18146 | 2.479 |
| 4176.18774 | 2.494 |
| 4177.19393 | 1.622 |
| 4178.20004 | 2.357 |
| 4179.20607 | 2.279 |
| 4180.21202 | 1.694 |
| 4181.21789 | 2.086 |
| 4182.22368 | 3.454 |
| 4183.22938 | 1.99 |
| 4184.235 | 1.532 |
| 4185.24055 | 2.622 |
| 4186.24601 | 2.802 |
| 4187.25138 | 2.063 |
| 4188.25668 | 1.854 |
| 4189.2619 | 2.214 |
| 4190.26703 | 2.162 |
| 4191.27208 | 2.286 |
| 4192.27705 | 2.011 |
| 4193.28194 | 2.549 |
| 4194.28674 | 2.959 |
| 4195.29147 | 2.317 |
| 4196.29611 | 1.638 |
| 4197.30067 | 2.939 |
| 4198.30515 | 1.589 |
| 4199.30955 | 1.396 |
| 4200.31386 | 1.044 |
| 4201.3181 | 3.179 |
| 4202.32225 | 2.063 |
| 4203.32632 | 1.434 |
| 4204.33031 | 0.749 |
| 4205.33421 | 2.105 |
| 4206.33804 | 2.574 |
| 4207.34178 | 0.421 |
| 4208.34544 | 0.349 |
| 4209.34902 | 1.409 |
| 4210.35251 | 0.716 |
| 4211.35592 | 1.234 |
| 4212.35926 | 1.276 |
| 4213.36251 | 0.751 |
| 4214.36567 | 2.766 |
| 4215.36876 | 2.213 |
| 4216.37176 | 2.466 |
| 4217.37468 | 1.881 |
| 4218.37752 | 2.005 |
| 4219.38028 | 2.113 |
| 4220.38295 | 1.468 |
| 4221.1349 | 1.858 |
| 4222.13743 | 2.452 |
| 4223.13988 | 1.372 |
| 4224.14224 | 1.839 |
| 4225.14453 | 0.432 |
| 4226.14673 | 0.055 |
| 4227.14885 | 1.327 |
| 4228.15088 | 1.419 |
| 4229.15283 | 1.458 |
| 4230.15471 | 2.116 |
| 4231.15649 | 1.707 |
| 4232.1582 | 1.584 |
| 4233.15982 | 0.576 |
| 4234.16136 | 2.371 |
| 4235.16282 | 1.662 |
| 4236.1642 | 1.598 |
| 4237.16549 | 1.462 |
| 4238.1667 | 2.288 |
| 4239.16783 | 1.669 |
| 4240.16887 | 2.453 |
| 4241.16984 | 2.389 |
| 4242.17072 | 1.89 |
| 4243.17151 | 1.896 |
| 4244.17223 | 1.28 |
| 4245.17286 | 2.057 |
| 4246.17341 | 2.142 |
| 4247.17388 | 0.87 |
| 4248.17426 | 2.203 |
| 4249.17456 | 1.819 |
| 4250.17478 | 1.125 |
| 4251.17491 | 0.365 |
| 4252.17496 | 1.901 |
| 4253.17493 | 2 |
| 4254.17482 | 0.068 |
| 4255.17462 | 2.011 |
| 4256.17434 | 0.235 |
| 4257.17398 | 2.171 |
| 4258.17354 | 2.117 |
| 4259.17301 | 2.616 |
| 4260.1724 | 1.866 |
| 4261.1717 | 2.443 |
| 4262.17092 | 1.462 |
| 4263.17006 | 2.45 |
| 4264.16912 | 0.252 |
| 4265.16809 | 2.409 |
| 4266.16698 | 1.94 |
| 4267.16579 | 2 |
| 4268.16451 | 0.85 |
| 4269.16315 | 1.918 |
| 4270.16171 | 1.889 |
| 4271.16018 | 0.729 |
| 4272.15857 | 0.499 |
| 4273.15688 | 2.177 |
| 4274.1551 | 1.699 |
| 4275.15324 | 1.954 |
| 4276.1513 | 2.024 |
| 4277.14927 | 2.266 |
| 4278.14716 | 1.885 |
| 4279.14497 | 1.451 |
| 4280.14269 | 0.006 |
| 4281.14033 | 1.66 |
| 4282.13789 | 2.044 |
| 4283.13536 | 1.873 |
| 4284.13275 | 1.459 |
| 4285.13006 | 0.301 |
| 4286.12728 | 1.618 |
| 4287.12442 | 1.741 |
| 4288.12148 | 0.6 |
| 4289.11845 | 0.457 |
| 4290.11534 | 1.008 |
| 4291.11214 | 1.118 |
| 4292.35803 | 1.677 |
| 4293.35465 | 1.79 |
| 4294.35118 | 1.373 |
| 4295.34763 | 0.774 |
| 4296.34399 | 1.529 |
| 4297.34027 | 1.708 |
| 4298.33647 | 1.094 |
| 4299.33259 | 1.263 |
| 4300.32862 | 1.756 |
| 4301.32456 | 2.475 |
| 4302.32042 | 1.721 |
| 4303.3162 | 0.866 |
| 4304.3119 | 1.828 |
| 4305.30751 | 0.99 |
| 4306.30303 | 0.348 |
| 4307.29848 | 1.272 |
| 4308.29384 | 0.854 |
| 4309.28911 | 1.617 |
| 4310.2843 | 0.94 |
| 4311.27941 | 1.524 |
| 4312.27443 | 1.404 |
| 4313.26937 | 0.835 |
| 4314.26422 | 0.871 |
| 4315.25899 | 1.178 |
| 4316.25368 | 0.799 |
| 4317.24828 | 0.204 |
| 4318.2428 | 0.045 |
| 4319.23723 | 0.155 |
| 4320.23158 | 0.597 |
| 4321.22585 | 1.576 |
| 4322.22003 | 1.207 |
| 4323.21413 | 0.18 |
| 4324.20814 | 0.864 |
| 4325.20207 | 0.468 |
| 4326.19591 | 1.283 |
| 4327.18967 | 0.035 |
| 4328.18335 | 0.172 |
| 4329.17694 | 0.444 |
| 4330.17044 | 0.438 |
| 4331.16387 | 0.772 |
| 4332.1572 | 0.229 |
| 4333.15046 | 1.064 |
| 4334.14363 | 0.672 |
| 4335.13671 | 1.022 |
| 4336.12971 | 0.218 |
| 4337.12262 | 0.093 |
| 4338.11545 | 0.076 |
| 4339.1082 | 0.039 |
| 4340.10086 | 0.489 |
| 4341.34157 | 0.529 |
| 4342.33404 | 0.966 |
| 4343.32643 | 0.562 |
| 4344.31873 | 1.037 |
| 4345.31095 | 0.248 |
| 4346.30308 | 0.266 |
| 4347.29513 | 2.157 |
| 4348.28709 | 0.292 |
| 4349.27897 | 0.317 |
| 4350.27076 | 0.251 |
| 4351.26247 | 0.054 |
| 4352.25409 | 0.341 |
| 4353.24563 | 0.186 |
| 4354.23708 | 0.069 |
| 4355.22845 | 0.075 |
| 4356.21974 | 0.576 |
| 4357.21094 | 0.214 |
| 4358.20205 | 0.876 |
| 4359.19308 | 0.669 |
| 4360.18402 | 1.273 |
| 4361.17488 | 0.893 |
| 4362.16566 | 0.46 |
| 4363.15635 | 0.998 |
| 4364.14695 | 0.102 |
| 4365.13747 | 0.994 |
| 4366.1279 | 0.083 |
| 4367.11825 | 1.277 |
| 4368.10852 | 0.198 |
| 4369.09869 | 1.148 |
| 4370.08879 | 0.348 |
| 4371.32628 | 0.161 |
| 4372.31619 | 0.351 |
| 4373.306 | 0.376 |
| 4374.29573 | 0.425 |
| 4375.28538 | 1.246 |
| 4376.27494 | 0.293 |
| 4377.26441 | 0.107 |
| 4378.2538 | 0.08 |
| 4379.24311 | 0.934 |
| 4380.23233 | 0.025 |
| 4381.22146 | 0.426 |
| 4382.21051 | 0.818 |
| 4383.19947 | 0.852 |
| 4384.18835 | 0.059 |
| 4385.17714 | 0.398 |
| 4386.16585 | 0.33 |
| 4387.15447 | 0.267 |
| 4388.14301 | 0.388 |
| 4389.13146 | 0.039 |
| 4390.11982 | 1.058 |
| 4391.1081 | 0.18 |
| 4392.09629 | 0.957 |
| 4393.0844 | 0.264 |
| 4394.31941 | 0.557 |
| 4395.30733 | 0.643 |
| 4396.29516 | 0.552 |
| 4397.2829 | 0.483 |
| 4398.27056 | 0.338 |
| 4399.25813 | 0.344 |
| 4400.24562 | 0.493 |
| 4401.23302 | 0.062 |
| 4402.22033 | 0.458 |
| 4403.20756 | 0.351 |
| 4404.1947 | 1.129 |
| 4405.18176 | 0.087 |
| 4406.16873 | 0.548 |
| 4407.15562 | 0.347 |
| 4408.14241 | 0.37 |
| 4409.12913 | 0.752 |
| 4410.11576 | 0.91 |
| 4411.1023 | 0.921 |
| 4412.08875 | 0.211 |
| 4413.07512 | 0.574 |
| 4414.30796 | 0.212 |
| 4415.29414 | 0 |
| 4416.28023 | 0.84 |
| 4417.26623 | 0.016 |
| 4418.25215 | 0.252 |
| 4419.23798 | 0.064 |
| 4420.22373 | 0.215 |
| 4421.20938 | 0.799 |
| 4422.19496 | 0.003 |
| 4423.18044 | 0.382 |
| 4424.16584 | 0.367 |
| 4425.15116 | 0.657 |
| 4426.13639 | 0.179 |
| 4427.12153 | 0.153 |
| 4428.10658 | 0.082 |
| 4429.09155 | 0.612 |
| 4430.07644 | 0.054 |
| 4431.30742 | 0.232 |
| 4432.29211 | 0.585 |
| 4433.27671 | 0.22 |
| 4434.26122 | 0.366 |
| 4435.24565 | 1.18 |
| 4436.22999 | 0.443 |
| 4437.21425 | 0.436 |
| 4438.19842 | 0.752 |
| 4439.1825 | 0.201 |
| 4440.1665 | 0.471 |
| 4441.15041 | 0.238 |
| 4442.13423 | 0.754 |
| 4443.11797 | 0.284 |
| 4444.10162 | 0.377 |
| 4445.08518 | 0.141 |
| 4446.06866 | 0.114 |
| 4447.29788 | 0.576 |
| 4448.28116 | 0.517 |
| 4449.26436 | 0.016 |
| 4450.24747 | 0.233 |
| 4451.23049 | 0.365 |
| 4452.21342 | 1.008 |
| 4453.19627 | 0.101 |
| 4454.17903 | 0.22 |
| 4455.16171 | 0.046 |
| 4456.1443 | 0.749 |
| 4457.1268 | 0.057 |
| 4458.10921 | 0.486 |
| 4459.09154 | 0.496 |
| 4460.07378 | 1.268 |
| 4461.30145 | 0.374 |
| 4462.2835 | 1.069 |
| 4463.26545 | 0.062 |
| 4464.24732 | 0.325 |
| 4465.22911 | 0.834 |
| 4466.2108 | 0.312 |
| 4467.19241 | 0.702 |
| 4468.17393 | 0.406 |
| 4469.15537 | 0.239 |
| 4470.13672 | 0.534 |
| 4471.11798 | 1.143 |
| 4472.09915 | 1.128 |
| 4473.08024 | 0.033 |
| 4474.06124 | 0.228 |
| 4475.28736 | 1.383 |
| 4476.26816 | 1.541 |
| 4477.24888 | 0.51 |
| 4478.22951 | 0.913 |
| 4479.21005 | 1.11 |
| 4480.1905 | 0.432 |
| 4481.17087 | 0.782 |
| 4482.15115 | 0.553 |
| 4483.13134 | 0.159 |
| 4484.11144 | 0.068 |
| 4485.09146 | 0.572 |
| 4486.07139 | 0.154 |
| 4487.05123 | 0.411 |
| 4488.27591 | 1.217 |
| 4489.25555 | 0.779 |
| 4490.23511 | 0.785 |
| 4491.21458 | 1.482 |
| 4492.19396 | 0.661 |
| 4493.17326 | 0.898 |
| 4494.15246 | 0.056 |
| 4495.13158 | 1.109 |
| 4496.11062 | 0.264 |
| 4497.08956 | 0.578 |
| 4498.06842 | 0.136 |
| 4499.04719 | 0.61 |
| 4500.27052 | 0.009 |
| 4501.24909 | 0.558 |
| 4502.22758 | 0.697 |
| 4503.20597 | 0.984 |
| 4504.18428 | 0.56 |
| 4505.1625 | 0.473 |
| 4506.14063 | 0.382 |
| 4507.11868 | 0.348 |
| 4508.09664 | 0.824 |
| 4509.0745 | 0.044 |
| 4510.05229 | 0.023 |
| 4511.27439 | 0.407 |
| 4512.25197 | 0.384 |
| 4513.22947 | 0.237 |
| 4514.20687 | 0.411 |
| 4515.18419 | 0.273 |
| 4516.16142 | 0.309 |
| 4517.13857 | 0.459 |
| 4518.11562 | 0.461 |
| 4519.09259 | 0.363 |
| 4520.06947 | 0.298 |
| 4521.04626 | 0.308 |
| 4522.26712 | 1.127 |
| 4523.24371 | 0.707 |
| 4524.22022 | 0.001 |
| 4525.19663 | 0.671 |
| 4526.17296 | 0.483 |
| 4527.1492 | 0.765 |
| 4528.12535 | 0.07 |
| 4529.10142 | 0.696 |
| 4530.07739 | 0.052 |
| 4531.05328 | 0.039 |
| 4532.27301 | 0.165 |
| 4533.2487 | 0.166 |
| 4534.2243 | 0.062 |
| 4535.19981 | 0.586 |
| 4536.17523 | 0.262 |
| 4537.15056 | 0.43 |
| 4538.12581 | 0.368 |
| 4539.10097 | 0.378 |
| 4540.07603 | 0.088 |
| 4541.05101 | 0.049 |
| 4542.26961 | 0.881 |
| 4543.2444 | 0.146 |
| 4544.21909 | 1.039 |
| 4545.19369 | 1 |
| 4546.16821 | 0.476 |
| 4547.14263 | 0.713 |
| 4548.11697 | 0.193 |
| 4549.09122 | 0.659 |
| 4550.06538 | 0.494 |
| 4551.03945 | 0.258 |
| 4552.25692 | 1.066 |
| 4553.23079 | 0.085 |
| 4554.20457 | 0.305 |
| 4555.17827 | 0.608 |
| 4556.15187 | 0.202 |
| 4557.12539 | 0.244 |
| 4558.09882 | 0.786 |
| 4559.07215 | 0.033 |
| 4560.0454 | 0.42 |
| 4561.26184 | 0.533 |
| 4562.23489 | 0.243 |
| 4563.20785 | 0.444 |
| 4564.18073 | 0.019 |
| 4565.15351 | 0.594 |
| 4566.1262 | 0.153 |
| 4567.09881 | 0.352 |
| 4568.07133 | 0.33 |
| 4569.04375 | 0.092 |
| 4570.25916 | 0.422 |
| 4571.23139 | 0.175 |
| 4572.20353 | 0.392 |
| 4573.17557 | 0.183 |
| 4574.14753 | 0.856 |
| 4575.1194 | 0.41 |
| 4576.09118 | 0.576 |
| 4577.06288 | 0.893 |
| 4578.03448 | 0.698 |
| 4579.24886 | 0.013 |
| 4580.22026 | 0.205 |
| 4581.19157 | 0.374 |
| 4582.16279 | 0.541 |
| 4583.13393 | 0.082 |
| 4584.10497 | 0.539 |
| 4585.07593 | 0.185 |
| 4586.04679 | 0.423 |
| 4587.01757 | 0.041 |
| 4588.23091 | 0.289 |
| 4589.20149 | 0.572 |
| 4590.17197 | 1.317 |
| 4591.14237 | 0.164 |
| 4592.11267 | 0.148 |
| 4593.08289 | 0.043 |
| 4594.05302 | 0.011 |
| 4595.02306 | 1.14 |
| 4596.23548 | 1.034 |
| 4597.20531 | 0.483 |
| 4598.17506 | 0.595 |
| 4599.14472 | 0.003 |
| 4600.11429 | 0.732 |
| 4601.08376 | 0.962 |
| 4602.05315 | 0.364 |
| 4603.02245 | 0.981 |
| 4604.23395 | 0.114 |
| 4605.20304 | 0.044 |
| 4606.17205 | 0.337 |
| 4607.14097 | 0.143 |
| 4608.10979 | 0.19 |
| 4609.07853 | 0.272 |
| 4610.04718 | 0.152 |
| 4611.01573 | 0.08 |
| 4612.2263 | 0.696 |
| 4613.19466 | 0.736 |
| 4614.16292 | 0.397 |
| 4615.1311 | 1.045 |
| 4616.09918 | 0.479 |
| 4617.06718 | 1.204 |
| 4618.03508 | 0.353 |
| 4619.24484 | 0.231 |
| 4620.21254 | 0.445 |
| 4621.18015 | 0.196 |
| 4622.14768 | 0.247 |
| 4623.11511 | 0.542 |
| 4624.08245 | 0.584 |
| 4625.0497 | 0.218 |
| 4626.01687 | 0.047 |
| 4627.22569 | 0.601 |
| 4628.19265 | 0.497 |
| 4629.15952 | 0.409 |
| 4630.1263 | 0.727 |
| 4631.09298 | 1.188 |
| 4632.05958 | 0.162 |
| 4633.02609 | 0.435 |
| 4634.2341 | 0.531 |
| 4635.2004 | 0.06 |
| 4636.16662 | 0.527 |
| 4637.13274 | 0.688 |
| 4638.09877 | 0.943 |
| 4639.06472 | 0.08 |
| 4640.03057 | 0.62 |
| 4641.23776 | 0.494 |
| 4642.2034 | 0.336 |
| 4643.16896 | 0.266 |
| 4644.13443 | 0.14 |
| 4645.09981 | 1.073 |
| 4646.06509 | 0.322 |
| 4647.03029 | 0.444 |
| 4648.23666 | 0.778 |
| 4649.20165 | 0.57 |
| 4650.16655 | 0.543 |
| 4651.13136 | 0.164 |
| 4652.09608 | 0.449 |
| 4653.06071 | 0.077 |
| 4654.02525 | 0.067 |
| 4655.2308 | 0.66 |
| 4656.19513 | 0.609 |
| 4657.15937 | 1.034 |
| 4658.12353 | 0.4 |
| 4659.08759 | 0.505 |
| 4660.05156 | 0.075 |
| 4661.01544 | 0.445 |
| 4662.22016 | 0.244 |
| 4663.18384 | 0.453 |
| 4664.14743 | 1.266 |
| 4665.11092 | 0.431 |
| 4666.07432 | 0.227 |
| 4667.03764 | 0.365 |
| 4668.00086 | 0.156 |
| 4669.20476 | 0.268 |
| 4670.16777 | 0.585 |
| 4671.1307 | 0.29 |
| 4672.09353 | 0.063 |
| 4673.05628 | 0.562 |
| 4674.01893 | 0.304 |
| 4675.22211 | 0.137 |
| 4676.18456 | 0.135 |
| 4677.14692 | 0.139 |
| 4678.10918 | 0.238 |
| 4679.07136 | 0.042 |
| 4680.03344 | 0.073 |
| 4680.99543 | 0.12 |
| 4682.19779 | 0.075 |
| 4683.15958 | 0.316 |
| 4684.12127 | 0.341 |
| 4685.08287 | 0.549 |
| 4686.04439 | 0.512 |
| 4687.00581 | 0.812 |
| 4688.20745 | 0.664 |
| 4689.16867 | 0.497 |
| 4690.12979 | 1.231 |
| 4691.09082 | 0.8 |
| 4692.05176 | 0.744 |
| 4693.01261 | 1.231 |
| 4694.21355 | 0.765 |
| 4695.17419 | 1.03 |
| 4696.13474 | 0.622 |
| 4697.0952 | 0.602 |
| 4698.05557 | 0.839 |
| 4699.01585 | 0.33 |
| 4700.21606 | 0.984 |
| 4701.17613 | 0.086 |
| 4702.13611 | 0.316 |
| 4703.096 | 0.402 |
| 4704.0558 | 0.84 |
| 4705.0155 | 0.574 |
| 4706.215 | 0.181 |
| 4707.1745 | 0.125 |
| 4708.13391 | 0.61 |
| 4709.09322 | 0.069 |
| 4710.05244 | 1.465 |
| 4711.01157 | 0.162 |
| 4712.21036 | 0.992 |
| 4713.16928 | 0.362 |
| 4714.12811 | 0.142 |
| 4715.08685 | 0.279 |
| 4716.0455 | 0.104 |
| 4717.00406 | 0.421 |
| 4718.20212 | 0.664 |
| 4719.16047 | 1.238 |
| 4720.11873 | 0.284 |
| 4721.07689 | 0.435 |
| 4722.03497 | 0.012 |
| 4722.99295 | 1.323 |
| 4724.1903 | 1.148 |
| 4725.14807 | 0.338 |
| 4726.10575 | 0.33 |
| 4727.06334 | 1.07 |
| 4728.02084 | 0.457 |
| 4728.97824 | 0.088 |
| 4730.17487 | 0.077 |
| 4731.13207 | 0.61 |
| 4732.08917 | 0.362 |
| 4733.04619 | 0.233 |
| 4734.00311 | 0.485 |
| 4735.19913 | 0.142 |
| 4736.15584 | 0.586 |
| 4737.11246 | 0.692 |
| 4738.06899 | 0.127 |
| 4739.02543 | 0.114 |
| 4739.98177 | 0.463 |
| 4741.17707 | 0.464 |
| 4742.13321 | 0.317 |
| 4743.08925 | 1.255 |
| 4744.0452 | 0.231 |
| 4745.00106 | 0.182 |
| 4746.19576 | 0.223 |
| 4747.15141 | 0.307 |
| 4748.10696 | 0.087 |
| 4749.06243 | 0.148 |
| 4750.0178 | 0.204 |
| 4750.97308 | 0.422 |
| 4752.16705 | 0.008 |
| 4753.12212 | 0.347 |
| 4754.0771 | 0.695 |
| 4755.03199 | 0.521 |
| 4755.98678 | 0.539 |
| 4757.18014 | 0.192 |
| 4758.13473 | 0.59 |
| 4759.08922 | 0.028 |
| 4760.04362 | 0.468 |
| 4760.99793 | 0.395 |
| 4762.19068 | 0.218 |
| 4763.14478 | 0.304 |
| 4764.09878 | 0.613 |
| 4765.0527 | 0.039 |
| 4766.00651 | 0.172 |
| 4766.96024 | 0.24 |
| 4768.15227 | 0.035 |
| 4769.10579 | 0.316 |
| 4770.05921 | 0.435 |
| 4771.01254 | 0.192 |
| 4771.96578 | 0.796 |
| 4773.1572 | 0.412 |
| 4774.11022 | 0.197 |
| 4775.06316 | 0.329 |
| 4776.016 | 0.604 |
| 4776.96875 | 0.821 |
| 4778.15956 | 0.233 |
| 4779.1121 | 0.545 |
| 4780.06454 | 0.182 |
| 4781.0169 | 0.548 |
| 4781.96916 | 0.59 |
| 4783.15935 | 0.341 |
| 4784.1114 | 0.206 |
| 4785.06336 | 0.614 |
| 4786.01522 | 0.136 |
| 4786.967 | 0.507 |
| 4788.15658 | 0.154 |
| 4789.10814 | 0.231 |
| 4790.05961 | 0.116 |
| 4791.01098 | 0.02 |
| 4791.96226 | 0.386 |
| 4793.15123 | 1.09 |
| 4794.1023 | 0.666 |
| 4795.05328 | 0.126 |
| 4796.00416 | 0.536 |
| 4796.95495 | 0.482 |
| 4798.14331 | 0.211 |
| 4799.09389 | 0.246 |
| 4800.04437 | 0.343 |
| 4800.99476 | 0.054 |
| 4802.18262 | 0.708 |
| 4803.1328 | 0.284 |
| 4804.08289 | 0.383 |
| 4805.03289 | 0.138 |
| 4805.98279 | 0.287 |
| 4807.17003 | 0.024 |
| 4808.11972 | 0.205 |
| 4809.06932 | 0.567 |
| 4810.01882 | 0.89 |
| 4810.96823 | 0.265 |
| 4812.15486 | 1.065 |
| 4813.10405 | 0.415 |
| 4814.05316 | 0.913 |
| 4815.00217 | 0.388 |
| 4815.95108 | 0.54 |
| 4817.1371 | 0.088 |
| 4818.0858 | 0.221 |
| 4819.03441 | 0.159 |
| 4819.98293 | 0.378 |
| 4821.16844 | 0.068 |
| 4822.11675 | 0.1 |
| 4823.06496 | 0.166 |
| 4824.01308 | 0.185 |
| 4824.9611 | 0.821 |
| 4826.146 | 0.272 |
| 4827.09381 | 0.03 |
| 4828.04153 | 0.332 |
| 4828.98915 | 0.718 |
| 4830.17355 | 0.306 |
| 4831.12096 | 0.591 |
| 4832.06828 | 0.489 |
| 4833.0155 | 0.098 |
| 4833.96263 | 0.864 |
| 4835.14641 | 0.817 |
| 4836.09332 | 0.375 |
| 4837.04015 | 0.194 |
| 4837.98687 | 0.37 |
| 4839.17015 | 0.126 |
| 4840.11667 | 0.21 |
| 4841.06309 | 0.489 |
| 4842.00942 | 0.156 |
| 4842.95565 | 0.535 |
| 4844.13831 | 0.095 |
| 4845.08433 | 0.769 |
| 4846.03025 | 0.276 |
| 4846.97609 | 0.633 |
| 4848.15824 | 0.101 |
| 4849.10386 | 0.53 |
| 4850.04939 | 0.684 |
| 4850.99482 | 0.132 |
| 4851.94015 | 0.08 |
| 4853.12169 | 0.501 |
| 4854.06681 | 0.008 |
| 4855.01184 | 0.474 |
| 4855.95677 | 0.134 |
| 4857.1378 | 0.044 |
| 4858.08252 | 0.526 |
| 4859.02715 | 0.742 |
| 4859.97168 | 0.378 |
| 4861.15221 | 0.903 |
| 4862.09653 | 0.7 |
| 4863.04075 | 0.686 |
| 4863.98488 | 0.57 |
| 4864.92891 | 0.171 |
| 4866.10882 | 0.818 |
| 4867.05264 | 0.212 |
| 4867.99636 | 0.116 |
| 4868.93999 | 0.023 |
| 4870.11939 | 0.127 |
| 4871.06281 | 1.071 |
| 4872.00613 | 0.342 |
| 4872.94936 | 0.546 |
| 4874.12826 | 0.733 |
| 4875.07127 | 0.802 |
| 4876.01419 | 0.537 |
| 4876.95701 | 0.548 |
| 4878.1354 | 0.084 |
| 4879.07801 | 0.14 |
| 4880.02053 | 0.973 |
| 4880.96294 | 0.153 |
| 4882.14083 | 1.237 |
| 4883.08304 | 0.046 |
| 4884.02514 | 0.175 |
| 4884.96716 | 0.288 |
| 4886.14454 | 0.288 |
| 4887.08634 | 0.542 |
| 4888.02804 | 0.509 |
| 4888.96965 | 0.301 |
| 4890.14653 | 0.328 |
| 4891.08792 | 0.553 |
| 4892.02922 | 0.645 |
| 4892.97043 | 0.36 |
| 4894.1468 | 0.388 |
| 4895.08779 | 0.296 |
| 4896.02868 | 0.175 |
| 4896.96948 | 1.07 |
| 4898.14534 | 0.453 |
| 4899.08592 | 0.548 |
| 4900.02641 | 0.024 |
| 4900.9668 | 0.008 |
| 4902.14216 | 0.031 |
| 4903.08234 | 0.001 |
| 4904.02242 | 0.014 |
| 4904.9624 | 0.114 |
| 4906.13725 | 0.201 |
| 4907.07702 | 0.077 |
| 4908.0167 | 0.332 |
| 4908.95628 | 0.346 |
| 4910.13062 | 0.436 |
| 4911.06998 | 0.428 |
| 4912.00925 | 0.589 |
| 4912.94842 | 0.341 |
| 4914.12225 | 0.304 |
| 4915.06121 | 0.516 |
| 4916.00007 | 0.871 |
| 4916.93883 | 0.601 |
| 4918.11216 | 0.245 |
| 4919.05071 | 0.395 |
| 4919.98916 | 0.177 |
| 4920.92752 | 0.182 |
| 4922.10033 | 0.342 |
| 4923.03847 | 0.012 |
| 4923.97652 | 0.681 |
| 4924.91447 | 0.068 |
| 4926.08677 | 0.052 |
| 4927.0245 | 0.477 |
| 4927.96214 | 0.197 |
| 4929.13405 | 0.491 |
| 4930.07147 | 0.275 |
| 4931.0088 | 0.131 |
| 4931.94603 | 0.072 |
| 4933.11743 | 0.131 |
| 4934.05444 | 0.211 |
| 4934.99136 | 0.079 |
| 4935.92818 | 1.354 |
| 4937.09907 | 0.083 |
| 4938.03568 | 0.541 |
| 4938.97218 | 0.962 |
| 4939.9086 | 0.345 |
| 4941.07897 | 0.263 |
| 4942.01517 | 0.553 |
| 4942.95127 | 0.183 |
| 4944.12125 | 0.648 |
| 4945.05714 | 0.796 |
| 4945.99292 | 1.319 |
| 4946.92861 | 0.803 |
| 4948.09809 | 0.04 |
| 4949.03356 | 0.38 |
| 4949.96893 | 0.639 |
| 4950.90421 | 0.006 |
| 4952.07317 | 0.627 |
| 4953.00824 | 0.035 |
| 4953.9432 | 1.236 |
| 4955.11177 | 0.092 |
| 4956.04652 | 0.567 |
| 4956.98117 | 0.526 |
| 4957.91572 | 0.317 |
| 4959.08378 | 0.268 |
| 4960.01812 | 0.558 |
| 4960.95236 | 0.292 |
| 4962.12002 | 0.608 |
| 4963.05404 | 0.388 |
| 4963.98797 | 0.362 |
| 4964.9218 | 0.575 |
| 4966.08895 | 0.463 |
| 4967.02256 | 0.405 |
| 4967.95608 | 0.845 |
| 4969.12283 | 0.438 |
| 4970.05613 | 0.168 |
| 4970.98933 | 0.224 |
| 4971.92243 | 0.866 |
| 4973.08867 | 0.253 |
| 4974.02156 | 0.789 |
| 4974.95434 | 0.372 |
| 4976.12019 | 0.216 |
| 4977.05276 | 0.41 |
| 4977.98523 | 0.063 |
| 4978.91761 | 0.198 |
| 4980.08294 | 0.56 |
| 4981.0151 | 0.499 |
| 4981.94716 | 0.915 |
| 4983.1121 | 0.308 |
| 4984.04394 | 0.568 |
| 4984.97568 | 0.639 |
| 4985.90733 | 0.093 |
| 4987.07175 | 0.796 |
| 4988.00318 | 1.085 |
| 4988.93451 | 0.614 |
| 4990.09854 | 0.489 |
| 4991.02965 | 0.351 |
| 4991.96066 | 0.277 |
| 4992.89158 | 0.033 |
| 4994.05509 | 0.729 |
| 4994.98579 | 0.122 |
| 4995.91639 | 0.378 |
| 4997.0795 | 0.124 |
| 4998.00988 | 1.195 |
| 4998.94017 | 1.21 |
| 5000.10289 | 1.225 |